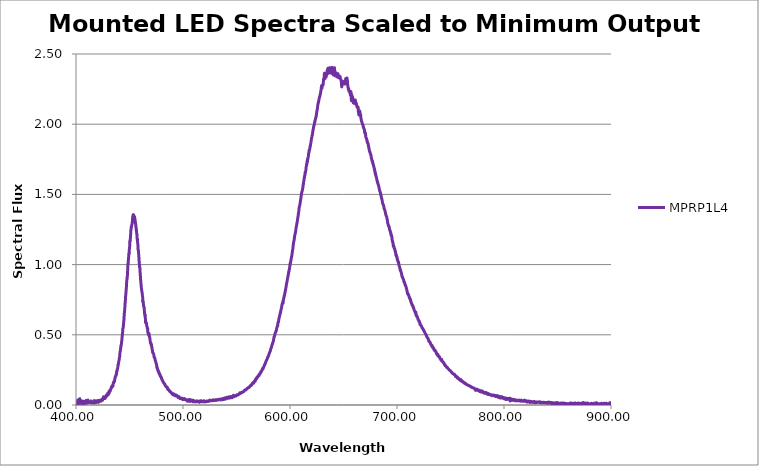
| Category | MPRP1L4 |
|---|---|
| 199.975 | 0 |
| 200.177 | 0 |
| 200.378 | 0 |
| 200.58 | 0 |
| 200.781 | 0 |
| 200.983 | 0 |
| 201.184 | 0 |
| 201.386 | 0 |
| 201.588 | 0 |
| 201.789 | 0 |
| 201.991 | 0 |
| 202.193 | 0 |
| 202.394 | 0 |
| 202.596 | 0 |
| 202.798 | 0 |
| 202.999 | 0 |
| 203.201 | 0 |
| 203.403 | 0 |
| 203.605 | 0 |
| 203.806 | 0 |
| 204.008 | 0 |
| 204.21 | 0 |
| 204.412 | 0 |
| 204.614 | 0 |
| 204.816 | 0 |
| 205.018 | 0 |
| 205.219 | 0 |
| 205.421 | 0 |
| 205.623 | 0 |
| 205.825 | 0 |
| 206.027 | 0 |
| 206.229 | 0 |
| 206.431 | 0 |
| 206.633 | 0 |
| 206.836 | 0 |
| 207.038 | 0 |
| 207.24 | 0 |
| 207.442 | 0 |
| 207.644 | 0 |
| 207.846 | 0 |
| 208.048 | 0 |
| 208.251 | 0 |
| 208.453 | 0 |
| 208.655 | 0 |
| 208.857 | 0 |
| 209.06 | 0 |
| 209.262 | 0 |
| 209.464 | 0 |
| 209.667 | 0 |
| 209.869 | 0 |
| 210.071 | 0 |
| 210.274 | 0 |
| 210.476 | 0 |
| 210.678 | 0 |
| 210.881 | 0 |
| 211.083 | 0 |
| 211.286 | 0 |
| 211.488 | 0 |
| 211.691 | 0 |
| 211.893 | 0 |
| 212.096 | 0 |
| 212.299 | 0 |
| 212.501 | 0 |
| 212.704 | 0 |
| 212.906 | 0 |
| 213.109 | 0 |
| 213.312 | 0 |
| 213.514 | 0 |
| 213.717 | 0 |
| 213.92 | 0 |
| 214.123 | 0 |
| 214.325 | 0 |
| 214.528 | 0 |
| 214.731 | 0 |
| 214.934 | 0 |
| 215.137 | 0 |
| 215.339 | 0 |
| 215.542 | 0 |
| 215.745 | 0 |
| 215.948 | 0 |
| 216.151 | 0 |
| 216.354 | 0 |
| 216.557 | 0 |
| 216.76 | 0 |
| 216.963 | 0 |
| 217.166 | 0 |
| 217.369 | 0 |
| 217.572 | 0 |
| 217.775 | 0 |
| 217.978 | 0 |
| 218.181 | 0 |
| 218.385 | 0 |
| 218.588 | 0 |
| 218.791 | 0 |
| 218.994 | 0 |
| 219.197 | 0 |
| 219.4 | 0 |
| 219.604 | 0 |
| 219.807 | 0 |
| 220.01 | 0 |
| 220.214 | 0 |
| 220.417 | 0 |
| 220.62 | 0 |
| 220.824 | 0 |
| 221.027 | 0 |
| 221.23 | 0 |
| 221.434 | 0 |
| 221.637 | 0 |
| 221.841 | 0 |
| 222.044 | 0 |
| 222.248 | 0 |
| 222.451 | 0 |
| 222.655 | 0 |
| 222.858 | 0 |
| 223.062 | 0 |
| 223.265 | 0 |
| 223.469 | 0 |
| 223.672 | 0 |
| 223.876 | 0 |
| 224.08 | 0 |
| 224.283 | 0 |
| 224.487 | 0 |
| 224.691 | 0 |
| 224.894 | 0 |
| 225.098 | 0 |
| 225.302 | 0 |
| 225.506 | 0 |
| 225.71 | 0 |
| 225.913 | 0 |
| 226.117 | 0 |
| 226.321 | 0 |
| 226.525 | 0 |
| 226.729 | 0 |
| 226.933 | 0 |
| 227.137 | 0 |
| 227.341 | 0 |
| 227.544 | 0 |
| 227.748 | 0 |
| 227.952 | 0 |
| 228.156 | 0 |
| 228.361 | 0 |
| 228.565 | 0 |
| 228.769 | 0 |
| 228.973 | 0 |
| 229.177 | 0 |
| 229.381 | 0 |
| 229.585 | 0 |
| 229.789 | 0 |
| 229.993 | 0 |
| 230.198 | 0 |
| 230.402 | 0 |
| 230.606 | 0 |
| 230.81 | 0 |
| 231.015 | 0 |
| 231.219 | 0 |
| 231.423 | 0 |
| 231.627 | 0 |
| 231.832 | 0 |
| 232.036 | 0 |
| 232.241 | 0 |
| 232.445 | 0 |
| 232.649 | 0 |
| 232.854 | 0 |
| 233.058 | 0 |
| 233.263 | 0 |
| 233.467 | 0 |
| 233.672 | 0 |
| 233.876 | 0 |
| 234.081 | 0 |
| 234.285 | 0 |
| 234.49 | 0 |
| 234.695 | 0 |
| 234.899 | 0 |
| 235.104 | 0 |
| 235.308 | 0 |
| 235.513 | 0 |
| 235.718 | 0 |
| 235.922 | 0 |
| 236.127 | 0 |
| 236.332 | 0 |
| 236.537 | 0 |
| 236.741 | 0 |
| 236.946 | 0 |
| 237.151 | 0 |
| 237.356 | 0 |
| 237.561 | 0 |
| 237.766 | 0 |
| 237.971 | 0 |
| 238.175 | 0 |
| 238.38 | 0 |
| 238.585 | 0 |
| 238.79 | 0 |
| 238.995 | 0 |
| 239.2 | 0 |
| 239.405 | 0 |
| 239.61 | 0 |
| 239.815 | 0 |
| 240.02 | 0 |
| 240.225 | 0 |
| 240.431 | 0 |
| 240.636 | 0 |
| 240.841 | 0 |
| 241.046 | 0 |
| 241.251 | 0 |
| 241.456 | 0 |
| 241.662 | 0 |
| 241.867 | 0 |
| 242.072 | 0 |
| 242.277 | 0 |
| 242.483 | 0 |
| 242.688 | 0 |
| 242.893 | 0 |
| 243.098 | 0 |
| 243.304 | 0 |
| 243.509 | 0 |
| 243.715 | 0 |
| 243.92 | 0 |
| 244.125 | 0 |
| 244.331 | 0 |
| 244.536 | 0 |
| 244.742 | 0 |
| 244.947 | 0 |
| 245.153 | 0 |
| 245.358 | 0 |
| 245.564 | 0 |
| 245.769 | 0 |
| 245.975 | 0 |
| 246.181 | 0 |
| 246.386 | 0 |
| 246.592 | 0 |
| 246.798 | 0 |
| 247.003 | 0 |
| 247.209 | 0 |
| 247.415 | 0 |
| 247.62 | 0 |
| 247.826 | 0 |
| 248.032 | 0 |
| 248.238 | 0 |
| 248.443 | 0 |
| 248.649 | 0 |
| 248.855 | 0 |
| 249.061 | 0 |
| 249.267 | 0 |
| 249.473 | 0 |
| 249.679 | 0 |
| 249.885 | 0 |
| 250.091 | 0 |
| 250.297 | 0 |
| 250.502 | 0 |
| 250.708 | 0 |
| 250.914 | 0 |
| 251.121 | 0 |
| 251.327 | 0 |
| 251.533 | 0 |
| 251.739 | 0 |
| 251.945 | 0 |
| 252.151 | 0 |
| 252.357 | 0 |
| 252.563 | 0 |
| 252.769 | 0 |
| 252.976 | 0 |
| 253.182 | 0 |
| 253.388 | 0 |
| 253.594 | 0 |
| 253.801 | 0 |
| 254.007 | 0 |
| 254.213 | 0 |
| 254.419 | 0 |
| 254.626 | 0 |
| 254.832 | 0 |
| 255.039 | 0 |
| 255.245 | 0 |
| 255.451 | 0 |
| 255.658 | 0 |
| 255.864 | 0 |
| 256.071 | 0 |
| 256.277 | 0 |
| 256.484 | 0 |
| 256.69 | 0 |
| 256.897 | 0 |
| 257.103 | 0 |
| 257.31 | 0 |
| 257.516 | 0 |
| 257.723 | 0 |
| 257.93 | 0 |
| 258.136 | 0 |
| 258.343 | 0 |
| 258.55 | 0 |
| 258.756 | 0 |
| 258.963 | 0 |
| 259.17 | 0 |
| 259.376 | 0 |
| 259.583 | 0 |
| 259.79 | 0 |
| 259.997 | 0 |
| 260.204 | 0 |
| 260.41 | 0 |
| 260.617 | 0 |
| 260.824 | 0 |
| 261.031 | 0 |
| 261.238 | 0 |
| 261.445 | 0 |
| 261.652 | 0 |
| 261.859 | 0 |
| 262.066 | 0 |
| 262.273 | 0 |
| 262.48 | 0 |
| 262.687 | 0 |
| 262.894 | 0 |
| 263.101 | 0 |
| 263.308 | 0 |
| 263.515 | 0 |
| 263.722 | 0 |
| 263.929 | 0 |
| 264.136 | 0 |
| 264.343 | 0 |
| 264.551 | 0 |
| 264.758 | 0 |
| 264.965 | 0 |
| 265.172 | 0 |
| 265.38 | 0 |
| 265.587 | 0 |
| 265.794 | 0 |
| 266.001 | 0 |
| 266.209 | 0 |
| 266.416 | 0 |
| 266.623 | 0 |
| 266.831 | 0 |
| 267.038 | 0 |
| 267.246 | 0 |
| 267.453 | 0 |
| 267.66 | 0 |
| 267.868 | 0 |
| 268.075 | 0 |
| 268.283 | 0 |
| 268.49 | 0 |
| 268.698 | 0 |
| 268.905 | 0 |
| 269.113 | 0 |
| 269.321 | 0 |
| 269.528 | 0 |
| 269.736 | 0 |
| 269.943 | 0 |
| 270.151 | 0 |
| 270.359 | 0 |
| 270.567 | 0 |
| 270.774 | 0 |
| 270.982 | 0 |
| 271.19 | 0 |
| 271.397 | 0 |
| 271.605 | 0 |
| 271.813 | 0 |
| 272.021 | 0 |
| 272.229 | 0 |
| 272.436 | 0 |
| 272.644 | 0 |
| 272.852 | 0 |
| 273.06 | 0 |
| 273.268 | 0 |
| 273.476 | 0 |
| 273.684 | 0 |
| 273.892 | 0 |
| 274.1 | 0 |
| 274.308 | 0 |
| 274.516 | 0 |
| 274.724 | 0 |
| 274.932 | 0 |
| 275.14 | 0 |
| 275.348 | 0 |
| 275.556 | 0 |
| 275.764 | 0 |
| 275.973 | 0 |
| 276.181 | 0 |
| 276.389 | 0 |
| 276.597 | 0 |
| 276.805 | 0 |
| 277.013 | 0 |
| 277.222 | 0 |
| 277.43 | 0 |
| 277.638 | 0 |
| 277.847 | 0 |
| 278.055 | 0 |
| 278.263 | 0 |
| 278.472 | 0 |
| 278.68 | 0 |
| 278.888 | 0 |
| 279.097 | 0 |
| 279.305 | 0 |
| 279.514 | 0 |
| 279.722 | 0 |
| 279.93 | 0 |
| 280.139 | 0 |
| 280.347 | 0 |
| 280.556 | 0 |
| 280.764 | 0 |
| 280.973 | 0 |
| 281.182 | 0 |
| 281.39 | 0 |
| 281.599 | 0 |
| 281.807 | 0 |
| 282.016 | 0 |
| 282.225 | 0 |
| 282.433 | 0 |
| 282.642 | 0 |
| 282.851 | 0 |
| 283.06 | 0 |
| 283.268 | 0 |
| 283.477 | 0 |
| 283.686 | 0 |
| 283.895 | 0 |
| 284.103 | 0 |
| 284.312 | 0 |
| 284.521 | 0 |
| 284.73 | 0 |
| 284.939 | 0 |
| 285.148 | 0 |
| 285.357 | 0 |
| 285.566 | 0 |
| 285.775 | 0 |
| 285.984 | 0 |
| 286.193 | 0 |
| 286.402 | 0 |
| 286.611 | 0 |
| 286.82 | 0 |
| 287.029 | 0 |
| 287.238 | 0 |
| 287.447 | 0 |
| 287.656 | 0 |
| 287.865 | 0 |
| 288.074 | 0 |
| 288.283 | 0 |
| 288.492 | 0 |
| 288.702 | 0 |
| 288.911 | 0 |
| 289.12 | 0 |
| 289.329 | 0 |
| 289.539 | 0 |
| 289.748 | 0 |
| 289.957 | 0 |
| 290.166 | 0 |
| 290.376 | 0 |
| 290.585 | 0 |
| 290.795 | 0 |
| 291.004 | 0 |
| 291.213 | 0 |
| 291.423 | 0 |
| 291.632 | 0 |
| 291.842 | 0 |
| 292.051 | 0 |
| 292.26 | 0 |
| 292.47 | 0 |
| 292.68 | 0 |
| 292.889 | 0 |
| 293.099 | 0 |
| 293.308 | 0 |
| 293.518 | 0 |
| 293.727 | 0 |
| 293.937 | 0 |
| 294.147 | 0 |
| 294.356 | 0 |
| 294.566 | 0 |
| 294.776 | 0 |
| 294.985 | 0 |
| 295.195 | 0 |
| 295.405 | 0 |
| 295.614 | 0 |
| 295.824 | 0 |
| 296.034 | 0 |
| 296.244 | 0 |
| 296.454 | 0 |
| 296.663 | 0 |
| 296.873 | 0 |
| 297.083 | 0 |
| 297.293 | 0 |
| 297.503 | 0 |
| 297.713 | 0 |
| 297.923 | 0 |
| 298.133 | 0 |
| 298.343 | 0 |
| 298.553 | 0 |
| 298.763 | 0 |
| 298.973 | 0 |
| 299.183 | 0 |
| 299.393 | 0 |
| 299.603 | 0 |
| 299.813 | 0 |
| 300.023 | 0 |
| 300.233 | 0 |
| 300.443 | 0 |
| 300.654 | 0 |
| 300.864 | 0 |
| 301.074 | 0 |
| 301.284 | 0 |
| 301.494 | 0 |
| 301.705 | 0 |
| 301.915 | 0 |
| 302.125 | 0 |
| 302.335 | 0 |
| 302.546 | 0 |
| 302.756 | 0 |
| 302.966 | 0 |
| 303.177 | 0 |
| 303.387 | 0 |
| 303.598 | 0 |
| 303.808 | 0 |
| 304.018 | 0 |
| 304.229 | 0 |
| 304.439 | 0 |
| 304.65 | 0 |
| 304.86 | 0 |
| 305.071 | 0 |
| 305.281 | 0 |
| 305.492 | 0 |
| 305.702 | 0 |
| 305.913 | 0 |
| 306.124 | 0 |
| 306.334 | 0 |
| 306.545 | 0 |
| 306.755 | 0 |
| 306.966 | 0 |
| 307.177 | 0 |
| 307.387 | 0 |
| 307.598 | 0 |
| 307.809 | 0 |
| 308.02 | 0 |
| 308.23 | 0 |
| 308.441 | 0 |
| 308.652 | 0 |
| 308.863 | 0 |
| 309.074 | 0 |
| 309.284 | 0 |
| 309.495 | 0 |
| 309.706 | 0 |
| 309.917 | 0 |
| 310.128 | 0 |
| 310.339 | 0 |
| 310.55 | 0 |
| 310.761 | 0 |
| 310.972 | 0 |
| 311.183 | 0 |
| 311.394 | 0 |
| 311.605 | 0 |
| 311.816 | 0 |
| 312.027 | 0 |
| 312.238 | 0 |
| 312.449 | 0 |
| 312.66 | 0 |
| 312.871 | 0 |
| 313.083 | 0 |
| 313.294 | 0 |
| 313.505 | 0 |
| 313.716 | 0 |
| 313.927 | 0 |
| 314.139 | 0 |
| 314.35 | 0 |
| 314.561 | 0 |
| 314.772 | 0 |
| 314.984 | 0 |
| 315.195 | 0 |
| 315.406 | 0 |
| 315.618 | 0 |
| 315.829 | 0 |
| 316.04 | 0 |
| 316.252 | 0 |
| 316.463 | 0 |
| 316.675 | 0 |
| 316.886 | 0 |
| 317.097 | 0 |
| 317.309 | 0 |
| 317.52 | 0 |
| 317.732 | 0 |
| 317.943 | 0 |
| 318.155 | 0 |
| 318.367 | 0 |
| 318.578 | 0 |
| 318.79 | 0 |
| 319.001 | 0 |
| 319.213 | 0 |
| 319.425 | 0 |
| 319.636 | 0 |
| 319.848 | 0 |
| 320.06 | 0 |
| 320.271 | 0 |
| 320.483 | 0 |
| 320.695 | 0 |
| 320.907 | 0 |
| 321.118 | 0 |
| 321.33 | 0 |
| 321.542 | 0 |
| 321.754 | 0 |
| 321.966 | 0 |
| 322.177 | 0 |
| 322.389 | 0 |
| 322.601 | 0 |
| 322.813 | 0 |
| 323.025 | 0 |
| 323.237 | 0 |
| 323.449 | 0 |
| 323.661 | 0 |
| 323.873 | 0 |
| 324.085 | 0 |
| 324.297 | 0 |
| 324.509 | 0 |
| 324.721 | 0 |
| 324.933 | 0 |
| 325.145 | 0 |
| 325.357 | 0 |
| 325.569 | 0 |
| 325.781 | 0 |
| 325.994 | 0 |
| 326.206 | 0 |
| 326.418 | 0 |
| 326.63 | 0 |
| 326.842 | 0 |
| 327.055 | 0 |
| 327.267 | 0 |
| 327.479 | 0 |
| 327.691 | 0 |
| 327.904 | 0 |
| 328.116 | 0 |
| 328.328 | 0 |
| 328.541 | 0 |
| 328.753 | 0 |
| 328.965 | 0 |
| 329.178 | 0 |
| 329.39 | 0 |
| 329.603 | 0 |
| 329.815 | 0 |
| 330.028 | 0 |
| 330.24 | 0 |
| 330.453 | 0 |
| 330.665 | 0 |
| 330.878 | 0 |
| 331.09 | 0 |
| 331.303 | 0 |
| 331.515 | 0 |
| 331.728 | 0 |
| 331.94 | 0 |
| 332.153 | 0 |
| 332.366 | 0 |
| 332.578 | 0 |
| 332.791 | 0 |
| 333.004 | 0 |
| 333.216 | 0 |
| 333.429 | 0 |
| 333.642 | 0 |
| 333.855 | 0 |
| 334.067 | 0 |
| 334.28 | 0 |
| 334.493 | 0 |
| 334.706 | 0 |
| 334.919 | 0 |
| 335.132 | 0 |
| 335.344 | 0 |
| 335.557 | 0 |
| 335.77 | 0 |
| 335.983 | 0 |
| 336.196 | 0 |
| 336.409 | 0 |
| 336.622 | 0 |
| 336.835 | 0 |
| 337.048 | 0 |
| 337.261 | 0 |
| 337.474 | 0 |
| 337.687 | 0 |
| 337.9 | 0 |
| 338.113 | 0 |
| 338.326 | 0 |
| 338.539 | 0 |
| 338.752 | 0 |
| 338.966 | 0 |
| 339.179 | 0 |
| 339.392 | 0 |
| 339.605 | 0 |
| 339.818 | 0 |
| 340.032 | 0 |
| 340.245 | 0 |
| 340.458 | 0 |
| 340.671 | 0 |
| 340.885 | 0 |
| 341.098 | 0 |
| 341.311 | 0 |
| 341.525 | 0 |
| 341.738 | 0 |
| 341.951 | 0 |
| 342.165 | 0 |
| 342.378 | 0 |
| 342.591 | 0 |
| 342.805 | 0 |
| 343.018 | 0 |
| 343.232 | 0 |
| 343.445 | 0 |
| 343.659 | 0 |
| 343.872 | 0 |
| 344.086 | 0 |
| 344.299 | 0 |
| 344.513 | 0 |
| 344.727 | 0 |
| 344.94 | 0 |
| 345.154 | 0 |
| 345.367 | 0 |
| 345.581 | 0 |
| 345.795 | 0 |
| 346.008 | 0 |
| 346.222 | 0 |
| 346.436 | 0 |
| 346.649 | 0 |
| 346.863 | 0 |
| 347.077 | 0 |
| 347.291 | 0 |
| 347.504 | 0 |
| 347.718 | 0 |
| 347.932 | 0 |
| 348.146 | 0 |
| 348.36 | 0 |
| 348.574 | 0 |
| 348.787 | 0 |
| 349.001 | 0 |
| 349.215 | 0 |
| 349.429 | 0 |
| 349.643 | 0 |
| 349.857 | 0 |
| 350.071 | 0 |
| 350.285 | 0 |
| 350.499 | 0 |
| 350.713 | 0 |
| 350.927 | 0 |
| 351.141 | 0 |
| 351.355 | 0 |
| 351.569 | 0 |
| 351.783 | 0 |
| 351.998 | 0 |
| 352.212 | 0 |
| 352.426 | 0 |
| 352.64 | 0 |
| 352.854 | 0 |
| 353.068 | 0 |
| 353.283 | 0 |
| 353.497 | 0 |
| 353.711 | 0 |
| 353.925 | 0 |
| 354.14 | 0 |
| 354.354 | 0 |
| 354.568 | 0 |
| 354.783 | 0 |
| 354.997 | 0 |
| 355.211 | 0 |
| 355.426 | 0 |
| 355.64 | 0 |
| 355.854 | 0 |
| 356.069 | 0 |
| 356.283 | 0 |
| 356.498 | 0 |
| 356.712 | 0 |
| 356.927 | 0 |
| 357.141 | 0 |
| 357.356 | 0 |
| 357.57 | 0 |
| 357.785 | 0 |
| 357.999 | 0 |
| 358.214 | 0 |
| 358.429 | 0 |
| 358.643 | 0 |
| 358.858 | 0 |
| 359.072 | 0 |
| 359.287 | 0 |
| 359.502 | 0 |
| 359.716 | 0 |
| 359.931 | 0 |
| 360.146 | 0 |
| 360.361 | 0 |
| 360.575 | 0 |
| 360.79 | 0 |
| 361.005 | 0 |
| 361.22 | 0 |
| 361.434 | 0 |
| 361.649 | 0 |
| 361.864 | 0 |
| 362.079 | 0 |
| 362.294 | 0 |
| 362.509 | 0 |
| 362.724 | 0 |
| 362.939 | 0 |
| 363.154 | 0 |
| 363.369 | 0 |
| 363.583 | 0 |
| 363.798 | 0 |
| 364.013 | 0 |
| 364.228 | 0 |
| 364.444 | 0 |
| 364.659 | 0 |
| 364.874 | 0 |
| 365.089 | 0 |
| 365.304 | 0 |
| 365.519 | 0 |
| 365.734 | 0 |
| 365.949 | 0 |
| 366.164 | 0 |
| 366.38 | 0 |
| 366.595 | 0 |
| 366.81 | 0 |
| 367.025 | 0 |
| 367.24 | 0 |
| 367.456 | 0 |
| 367.671 | 0 |
| 367.886 | 0 |
| 368.101 | 0 |
| 368.317 | 0 |
| 368.532 | 0 |
| 368.747 | 0 |
| 368.963 | 0 |
| 369.178 | 0 |
| 369.394 | 0 |
| 369.609 | 0 |
| 369.824 | 0 |
| 370.04 | 0 |
| 370.255 | 0 |
| 370.471 | 0 |
| 370.686 | 0 |
| 370.902 | 0 |
| 371.117 | 0 |
| 371.333 | 0 |
| 371.548 | 0 |
| 371.764 | 0 |
| 371.98 | 0 |
| 372.195 | 0 |
| 372.411 | 0 |
| 372.626 | 0 |
| 372.842 | 0 |
| 373.058 | 0 |
| 373.273 | 0 |
| 373.489 | 0 |
| 373.705 | 0 |
| 373.92 | 0 |
| 374.136 | 0 |
| 374.352 | 0 |
| 374.568 | 0 |
| 374.783 | 0 |
| 374.999 | 0 |
| 375.215 | 0 |
| 375.431 | 0 |
| 375.647 | 0 |
| 375.863 | 0 |
| 376.078 | 0 |
| 376.294 | 0 |
| 376.51 | 0 |
| 376.726 | 0 |
| 376.942 | 0 |
| 377.158 | 0 |
| 377.374 | 0 |
| 377.59 | 0 |
| 377.806 | 0 |
| 378.022 | 0 |
| 378.238 | 0 |
| 378.454 | 0 |
| 378.67 | 0 |
| 378.886 | 0 |
| 379.102 | 0 |
| 379.318 | 0 |
| 379.535 | 0 |
| 379.751 | 0 |
| 379.967 | 0 |
| 380.183 | 0 |
| 380.399 | 0 |
| 380.615 | 0 |
| 380.832 | 0 |
| 381.048 | 0 |
| 381.264 | 0 |
| 381.48 | 0 |
| 381.697 | 0 |
| 381.913 | 0 |
| 382.129 | 0 |
| 382.346 | 0 |
| 382.562 | 0 |
| 382.778 | 0 |
| 382.995 | 0 |
| 383.211 | 0 |
| 383.427 | 0 |
| 383.644 | 0 |
| 383.86 | 0 |
| 384.077 | 0.004 |
| 384.293 | 0.023 |
| 384.51 | 0.027 |
| 384.726 | 0.038 |
| 384.943 | 0.049 |
| 385.159 | 0.044 |
| 385.376 | 0.035 |
| 385.592 | 0.032 |
| 385.809 | 0.045 |
| 386.025 | 0.04 |
| 386.242 | 0.043 |
| 386.458 | 0.033 |
| 386.675 | 0.052 |
| 386.892 | 0.02 |
| 387.108 | 0.026 |
| 387.325 | 0.027 |
| 387.542 | 0.027 |
| 387.758 | 0.02 |
| 387.975 | 0.027 |
| 388.192 | 0.032 |
| 388.409 | 0.024 |
| 388.625 | 0.037 |
| 388.842 | 0.029 |
| 389.059 | 0.017 |
| 389.276 | 0.042 |
| 389.493 | 0.02 |
| 389.709 | 0.028 |
| 389.926 | 0.024 |
| 390.143 | 0.038 |
| 390.36 | 0.031 |
| 390.577 | 0.028 |
| 390.794 | 0.007 |
| 391.011 | 0.024 |
| 391.228 | 0.033 |
| 391.445 | 0.032 |
| 391.662 | 0.007 |
| 391.879 | 0.03 |
| 392.096 | 0.015 |
| 392.313 | 0.02 |
| 392.53 | 0.025 |
| 392.747 | 0.021 |
| 392.964 | 0.014 |
| 393.181 | 0.025 |
| 393.398 | 0.025 |
| 393.615 | 0.015 |
| 393.832 | 0.015 |
| 394.049 | 0.023 |
| 394.267 | 0.017 |
| 394.484 | 0.016 |
| 394.701 | 0.013 |
| 394.918 | 0.018 |
| 395.135 | 0.008 |
| 395.353 | 0.006 |
| 395.57 | 0.033 |
| 395.787 | 0.037 |
| 396.004 | 0.018 |
| 396.222 | 0.013 |
| 396.439 | 0.01 |
| 396.656 | 0.009 |
| 396.874 | 0.033 |
| 397.091 | 0.01 |
| 397.308 | 0.019 |
| 397.526 | 0.015 |
| 397.743 | 0.023 |
| 397.96 | 0.015 |
| 398.178 | 0.012 |
| 398.395 | 0.013 |
| 398.613 | 0.014 |
| 398.83 | 0.009 |
| 399.048 | 0.023 |
| 399.265 | 0.026 |
| 399.483 | 0.004 |
| 399.7 | 0.013 |
| 399.918 | 0.012 |
| 400.135 | 0.027 |
| 400.353 | 0.022 |
| 400.571 | 0.018 |
| 400.788 | 0.018 |
| 401.006 | 0.03 |
| 401.223 | -0.003 |
| 401.441 | 0.024 |
| 401.659 | 0.014 |
| 401.876 | 0.021 |
| 402.094 | 0.017 |
| 402.312 | 0.038 |
| 402.53 | 0.012 |
| 402.747 | 0.031 |
| 402.965 | 0.029 |
| 403.183 | 0.034 |
| 403.401 | 0.014 |
| 403.618 | 0.045 |
| 403.836 | 0.012 |
| 404.054 | 0.024 |
| 404.272 | 0.013 |
| 404.49 | 0.025 |
| 404.708 | 0.021 |
| 404.926 | 0.031 |
| 405.144 | 0.023 |
| 405.361 | 0.027 |
| 405.579 | 0.018 |
| 405.797 | 0.016 |
| 406.015 | 0.011 |
| 406.233 | 0.026 |
| 406.451 | 0.015 |
| 406.669 | 0.027 |
| 406.887 | 0.023 |
| 407.105 | 0.024 |
| 407.323 | 0.011 |
| 407.541 | 0.017 |
| 407.76 | 0.018 |
| 407.978 | 0.019 |
| 408.196 | 0.012 |
| 408.414 | 0.022 |
| 408.632 | 0.028 |
| 408.85 | 0.023 |
| 409.068 | 0.014 |
| 409.287 | 0.013 |
| 409.505 | 0.033 |
| 409.723 | 0.017 |
| 409.941 | 0.022 |
| 410.159 | 0.014 |
| 410.378 | 0.025 |
| 410.596 | 0.021 |
| 410.814 | 0.028 |
| 411.033 | 0.018 |
| 411.251 | 0.037 |
| 411.469 | 0.017 |
| 411.688 | 0.024 |
| 411.906 | 0.02 |
| 412.124 | 0.022 |
| 412.343 | 0.022 |
| 412.561 | 0.021 |
| 412.78 | 0.009 |
| 412.998 | 0.017 |
| 413.216 | 0.017 |
| 413.435 | 0.021 |
| 413.653 | 0.019 |
| 413.872 | 0.029 |
| 414.09 | 0.025 |
| 414.309 | 0.025 |
| 414.528 | 0.018 |
| 414.746 | 0.023 |
| 414.965 | 0.015 |
| 415.183 | 0.019 |
| 415.402 | 0.022 |
| 415.62 | 0.018 |
| 415.839 | 0.017 |
| 416.058 | 0.02 |
| 416.276 | 0.018 |
| 416.495 | 0.017 |
| 416.714 | 0.017 |
| 416.932 | 0.031 |
| 417.151 | 0.023 |
| 417.37 | 0.025 |
| 417.589 | 0.018 |
| 417.807 | 0.015 |
| 418.026 | 0.02 |
| 418.245 | 0.026 |
| 418.464 | 0.02 |
| 418.683 | 0.03 |
| 418.901 | 0.018 |
| 419.12 | 0.021 |
| 419.339 | 0.021 |
| 419.558 | 0.022 |
| 419.777 | 0.026 |
| 419.996 | 0.026 |
| 420.215 | 0.021 |
| 420.434 | 0.029 |
| 420.653 | 0.032 |
| 420.872 | 0.027 |
| 421.091 | 0.019 |
| 421.31 | 0.03 |
| 421.529 | 0.026 |
| 421.748 | 0.025 |
| 421.967 | 0.028 |
| 422.186 | 0.034 |
| 422.405 | 0.028 |
| 422.624 | 0.03 |
| 422.843 | 0.03 |
| 423.062 | 0.036 |
| 423.281 | 0.027 |
| 423.5 | 0.033 |
| 423.72 | 0.031 |
| 423.939 | 0.036 |
| 424.158 | 0.034 |
| 424.377 | 0.041 |
| 424.596 | 0.036 |
| 424.816 | 0.033 |
| 425.035 | 0.042 |
| 425.254 | 0.044 |
| 425.473 | 0.05 |
| 425.693 | 0.059 |
| 425.912 | 0.053 |
| 426.131 | 0.046 |
| 426.351 | 0.051 |
| 426.57 | 0.056 |
| 426.789 | 0.049 |
| 427.009 | 0.049 |
| 427.228 | 0.047 |
| 427.448 | 0.06 |
| 427.667 | 0.054 |
| 427.886 | 0.062 |
| 428.106 | 0.059 |
| 428.325 | 0.07 |
| 428.545 | 0.065 |
| 428.764 | 0.068 |
| 428.984 | 0.065 |
| 429.203 | 0.071 |
| 429.423 | 0.072 |
| 429.642 | 0.083 |
| 429.862 | 0.079 |
| 430.082 | 0.074 |
| 430.301 | 0.075 |
| 430.521 | 0.081 |
| 430.74 | 0.094 |
| 430.96 | 0.098 |
| 431.18 | 0.085 |
| 431.399 | 0.098 |
| 431.619 | 0.098 |
| 431.839 | 0.106 |
| 432.058 | 0.1 |
| 432.278 | 0.11 |
| 432.498 | 0.113 |
| 432.718 | 0.119 |
| 432.937 | 0.119 |
| 433.157 | 0.128 |
| 433.377 | 0.125 |
| 433.597 | 0.136 |
| 433.817 | 0.137 |
| 434.036 | 0.139 |
| 434.256 | 0.139 |
| 434.476 | 0.134 |
| 434.696 | 0.149 |
| 434.916 | 0.16 |
| 435.136 | 0.155 |
| 435.356 | 0.166 |
| 435.576 | 0.169 |
| 435.796 | 0.171 |
| 436.016 | 0.168 |
| 436.236 | 0.185 |
| 436.456 | 0.19 |
| 436.676 | 0.201 |
| 436.896 | 0.204 |
| 437.116 | 0.204 |
| 437.336 | 0.207 |
| 437.556 | 0.221 |
| 437.776 | 0.217 |
| 437.996 | 0.239 |
| 438.216 | 0.237 |
| 438.436 | 0.251 |
| 438.656 | 0.251 |
| 438.877 | 0.26 |
| 439.097 | 0.268 |
| 439.317 | 0.29 |
| 439.537 | 0.286 |
| 439.757 | 0.3 |
| 439.978 | 0.309 |
| 440.198 | 0.314 |
| 440.418 | 0.33 |
| 440.638 | 0.34 |
| 440.859 | 0.345 |
| 441.079 | 0.376 |
| 441.299 | 0.379 |
| 441.519 | 0.391 |
| 441.74 | 0.405 |
| 441.96 | 0.422 |
| 442.181 | 0.421 |
| 442.401 | 0.435 |
| 442.621 | 0.448 |
| 442.842 | 0.462 |
| 443.062 | 0.48 |
| 443.283 | 0.503 |
| 443.503 | 0.506 |
| 443.724 | 0.542 |
| 443.944 | 0.545 |
| 444.164 | 0.555 |
| 444.385 | 0.575 |
| 444.606 | 0.591 |
| 444.826 | 0.61 |
| 445.047 | 0.641 |
| 445.267 | 0.66 |
| 445.488 | 0.675 |
| 445.708 | 0.7 |
| 445.929 | 0.726 |
| 446.15 | 0.746 |
| 446.37 | 0.772 |
| 446.591 | 0.791 |
| 446.812 | 0.813 |
| 447.032 | 0.831 |
| 447.253 | 0.865 |
| 447.474 | 0.881 |
| 447.694 | 0.906 |
| 447.915 | 0.907 |
| 448.136 | 0.942 |
| 448.357 | 0.967 |
| 448.577 | 1.01 |
| 448.798 | 1.009 |
| 449.019 | 1.041 |
| 449.24 | 1.057 |
| 449.461 | 1.083 |
| 449.682 | 1.078 |
| 449.902 | 1.113 |
| 450.123 | 1.125 |
| 450.344 | 1.167 |
| 450.565 | 1.166 |
| 450.786 | 1.186 |
| 451.007 | 1.205 |
| 451.228 | 1.241 |
| 451.449 | 1.25 |
| 451.67 | 1.27 |
| 451.891 | 1.269 |
| 452.112 | 1.283 |
| 452.333 | 1.287 |
| 452.554 | 1.296 |
| 452.775 | 1.316 |
| 452.996 | 1.34 |
| 453.217 | 1.346 |
| 453.438 | 1.356 |
| 453.659 | 1.353 |
| 453.88 | 1.353 |
| 454.101 | 1.344 |
| 454.323 | 1.325 |
| 454.544 | 1.339 |
| 454.765 | 1.34 |
| 454.986 | 1.328 |
| 455.207 | 1.319 |
| 455.429 | 1.299 |
| 455.65 | 1.295 |
| 455.871 | 1.275 |
| 456.092 | 1.272 |
| 456.314 | 1.243 |
| 456.535 | 1.244 |
| 456.756 | 1.217 |
| 456.977 | 1.213 |
| 457.199 | 1.176 |
| 457.42 | 1.183 |
| 457.641 | 1.151 |
| 457.863 | 1.14 |
| 458.084 | 1.104 |
| 458.306 | 1.101 |
| 458.527 | 1.078 |
| 458.748 | 1.056 |
| 458.97 | 1.028 |
| 459.191 | 1.009 |
| 459.413 | 0.98 |
| 459.634 | 0.985 |
| 459.856 | 0.95 |
| 460.077 | 0.931 |
| 460.299 | 0.898 |
| 460.52 | 0.886 |
| 460.742 | 0.859 |
| 460.963 | 0.848 |
| 461.185 | 0.826 |
| 461.407 | 0.818 |
| 461.628 | 0.805 |
| 461.85 | 0.798 |
| 462.071 | 0.779 |
| 462.293 | 0.77 |
| 462.515 | 0.732 |
| 462.736 | 0.74 |
| 462.958 | 0.723 |
| 463.18 | 0.706 |
| 463.402 | 0.698 |
| 463.623 | 0.698 |
| 463.845 | 0.678 |
| 464.067 | 0.651 |
| 464.289 | 0.646 |
| 464.51 | 0.63 |
| 464.732 | 0.639 |
| 464.954 | 0.59 |
| 465.176 | 0.59 |
| 465.398 | 0.583 |
| 465.619 | 0.588 |
| 465.841 | 0.577 |
| 466.063 | 0.568 |
| 466.285 | 0.56 |
| 466.507 | 0.555 |
| 466.729 | 0.543 |
| 466.951 | 0.543 |
| 467.173 | 0.516 |
| 467.395 | 0.515 |
| 467.617 | 0.506 |
| 467.839 | 0.5 |
| 468.061 | 0.509 |
| 468.283 | 0.508 |
| 468.505 | 0.487 |
| 468.727 | 0.489 |
| 468.949 | 0.477 |
| 469.171 | 0.465 |
| 469.393 | 0.453 |
| 469.615 | 0.441 |
| 469.837 | 0.441 |
| 470.059 | 0.44 |
| 470.282 | 0.425 |
| 470.504 | 0.431 |
| 470.726 | 0.415 |
| 470.948 | 0.413 |
| 471.17 | 0.395 |
| 471.393 | 0.391 |
| 471.615 | 0.374 |
| 471.837 | 0.372 |
| 472.059 | 0.368 |
| 472.282 | 0.368 |
| 472.504 | 0.362 |
| 472.726 | 0.357 |
| 472.948 | 0.344 |
| 473.171 | 0.339 |
| 473.393 | 0.339 |
| 473.615 | 0.332 |
| 473.838 | 0.329 |
| 474.06 | 0.316 |
| 474.283 | 0.313 |
| 474.505 | 0.309 |
| 474.727 | 0.299 |
| 474.95 | 0.295 |
| 475.172 | 0.291 |
| 475.395 | 0.281 |
| 475.617 | 0.265 |
| 475.84 | 0.269 |
| 476.062 | 0.261 |
| 476.285 | 0.255 |
| 476.507 | 0.246 |
| 476.73 | 0.249 |
| 476.952 | 0.238 |
| 477.175 | 0.234 |
| 477.397 | 0.229 |
| 477.62 | 0.233 |
| 477.843 | 0.222 |
| 478.065 | 0.218 |
| 478.288 | 0.215 |
| 478.511 | 0.218 |
| 478.733 | 0.207 |
| 478.956 | 0.206 |
| 479.179 | 0.2 |
| 479.401 | 0.202 |
| 479.624 | 0.196 |
| 479.847 | 0.194 |
| 480.069 | 0.185 |
| 480.292 | 0.182 |
| 480.515 | 0.179 |
| 480.738 | 0.178 |
| 480.961 | 0.171 |
| 481.183 | 0.168 |
| 481.406 | 0.164 |
| 481.629 | 0.162 |
| 481.852 | 0.161 |
| 482.075 | 0.157 |
| 482.298 | 0.154 |
| 482.521 | 0.152 |
| 482.743 | 0.152 |
| 482.966 | 0.148 |
| 483.189 | 0.141 |
| 483.412 | 0.14 |
| 483.635 | 0.137 |
| 483.858 | 0.134 |
| 484.081 | 0.132 |
| 484.304 | 0.132 |
| 484.527 | 0.127 |
| 484.75 | 0.13 |
| 484.973 | 0.126 |
| 485.196 | 0.125 |
| 485.419 | 0.125 |
| 485.642 | 0.114 |
| 485.866 | 0.11 |
| 486.089 | 0.113 |
| 486.312 | 0.112 |
| 486.535 | 0.111 |
| 486.758 | 0.108 |
| 486.981 | 0.104 |
| 487.204 | 0.101 |
| 487.428 | 0.101 |
| 487.651 | 0.096 |
| 487.874 | 0.095 |
| 488.097 | 0.095 |
| 488.32 | 0.093 |
| 488.544 | 0.094 |
| 488.767 | 0.092 |
| 488.99 | 0.087 |
| 489.214 | 0.084 |
| 489.437 | 0.085 |
| 489.66 | 0.083 |
| 489.884 | 0.079 |
| 490.107 | 0.078 |
| 490.33 | 0.076 |
| 490.554 | 0.074 |
| 490.777 | 0.073 |
| 491.0 | 0.076 |
| 491.224 | 0.08 |
| 491.447 | 0.076 |
| 491.671 | 0.077 |
| 491.894 | 0.076 |
| 492.118 | 0.072 |
| 492.341 | 0.068 |
| 492.565 | 0.066 |
| 492.788 | 0.07 |
| 493.012 | 0.071 |
| 493.235 | 0.065 |
| 493.459 | 0.066 |
| 493.682 | 0.067 |
| 493.906 | 0.07 |
| 494.129 | 0.066 |
| 494.353 | 0.062 |
| 494.577 | 0.062 |
| 494.8 | 0.062 |
| 495.024 | 0.062 |
| 495.248 | 0.056 |
| 495.471 | 0.053 |
| 495.695 | 0.056 |
| 495.919 | 0.058 |
| 496.142 | 0.06 |
| 496.366 | 0.053 |
| 496.59 | 0.054 |
| 496.814 | 0.05 |
| 497.037 | 0.047 |
| 497.261 | 0.051 |
| 497.485 | 0.049 |
| 497.709 | 0.046 |
| 497.932 | 0.047 |
| 498.156 | 0.046 |
| 498.38 | 0.049 |
| 498.604 | 0.044 |
| 498.828 | 0.044 |
| 499.052 | 0.047 |
| 499.276 | 0.048 |
| 499.5 | 0.044 |
| 499.723 | 0.045 |
| 499.947 | 0.038 |
| 500.171 | 0.045 |
| 500.395 | 0.041 |
| 500.619 | 0.044 |
| 500.843 | 0.039 |
| 501.067 | 0.044 |
| 501.291 | 0.039 |
| 501.515 | 0.046 |
| 501.739 | 0.039 |
| 501.963 | 0.041 |
| 502.187 | 0.037 |
| 502.412 | 0.039 |
| 502.636 | 0.036 |
| 502.86 | 0.037 |
| 503.084 | 0.037 |
| 503.308 | 0.037 |
| 503.532 | 0.033 |
| 503.756 | 0.038 |
| 503.98 | 0.027 |
| 504.205 | 0.036 |
| 504.429 | 0.037 |
| 504.653 | 0.037 |
| 504.877 | 0.027 |
| 505.101 | 0.034 |
| 505.326 | 0.029 |
| 505.55 | 0.035 |
| 505.774 | 0.034 |
| 505.999 | 0.029 |
| 506.223 | 0.039 |
| 506.447 | 0.036 |
| 506.672 | 0.025 |
| 506.896 | 0.037 |
| 507.12 | 0.028 |
| 507.345 | 0.03 |
| 507.569 | 0.029 |
| 507.793 | 0.033 |
| 508.018 | 0.032 |
| 508.242 | 0.035 |
| 508.467 | 0.031 |
| 508.691 | 0.028 |
| 508.916 | 0.026 |
| 509.14 | 0.027 |
| 509.364 | 0.023 |
| 509.589 | 0.033 |
| 509.813 | 0.031 |
| 510.038 | 0.026 |
| 510.263 | 0.024 |
| 510.487 | 0.027 |
| 510.712 | 0.029 |
| 510.936 | 0.027 |
| 511.161 | 0.023 |
| 511.385 | 0.027 |
| 511.61 | 0.026 |
| 511.835 | 0.022 |
| 512.059 | 0.024 |
| 512.284 | 0.024 |
| 512.509 | 0.024 |
| 512.733 | 0.026 |
| 512.958 | 0.03 |
| 513.183 | 0.028 |
| 513.407 | 0.024 |
| 513.632 | 0.027 |
| 513.857 | 0.024 |
| 514.082 | 0.023 |
| 514.306 | 0.027 |
| 514.531 | 0.025 |
| 514.756 | 0.026 |
| 514.981 | 0.023 |
| 515.206 | 0.02 |
| 515.43 | 0.028 |
| 515.655 | 0.027 |
| 515.88 | 0.026 |
| 516.105 | 0.024 |
| 516.33 | 0.024 |
| 516.555 | 0.023 |
| 516.78 | 0.032 |
| 517.005 | 0.024 |
| 517.23 | 0.026 |
| 517.455 | 0.024 |
| 517.679 | 0.023 |
| 517.904 | 0.023 |
| 518.129 | 0.025 |
| 518.354 | 0.026 |
| 518.579 | 0.026 |
| 518.804 | 0.023 |
| 519.03 | 0.024 |
| 519.255 | 0.028 |
| 519.48 | 0.03 |
| 519.705 | 0.026 |
| 519.93 | 0.023 |
| 520.155 | 0.023 |
| 520.38 | 0.028 |
| 520.605 | 0.024 |
| 520.83 | 0.022 |
| 521.055 | 0.026 |
| 521.281 | 0.024 |
| 521.506 | 0.027 |
| 521.731 | 0.026 |
| 521.956 | 0.025 |
| 522.181 | 0.027 |
| 522.407 | 0.027 |
| 522.632 | 0.025 |
| 522.857 | 0.028 |
| 523.082 | 0.027 |
| 523.308 | 0.028 |
| 523.533 | 0.025 |
| 523.758 | 0.026 |
| 523.984 | 0.028 |
| 524.209 | 0.028 |
| 524.434 | 0.029 |
| 524.66 | 0.032 |
| 524.885 | 0.035 |
| 525.11 | 0.034 |
| 525.336 | 0.03 |
| 525.561 | 0.029 |
| 525.787 | 0.03 |
| 526.012 | 0.03 |
| 526.238 | 0.032 |
| 526.463 | 0.031 |
| 526.689 | 0.03 |
| 526.914 | 0.031 |
| 527.14 | 0.034 |
| 527.365 | 0.031 |
| 527.591 | 0.034 |
| 527.816 | 0.036 |
| 528.042 | 0.031 |
| 528.267 | 0.033 |
| 528.493 | 0.037 |
| 528.718 | 0.036 |
| 528.944 | 0.035 |
| 529.17 | 0.033 |
| 529.395 | 0.033 |
| 529.621 | 0.032 |
| 529.847 | 0.034 |
| 530.072 | 0.036 |
| 530.298 | 0.037 |
| 530.524 | 0.038 |
| 530.749 | 0.037 |
| 530.975 | 0.033 |
| 531.201 | 0.035 |
| 531.426 | 0.037 |
| 531.652 | 0.037 |
| 531.878 | 0.039 |
| 532.104 | 0.036 |
| 532.33 | 0.036 |
| 532.555 | 0.035 |
| 532.781 | 0.035 |
| 533.007 | 0.039 |
| 533.233 | 0.038 |
| 533.459 | 0.039 |
| 533.685 | 0.04 |
| 533.91 | 0.041 |
| 534.136 | 0.038 |
| 534.362 | 0.04 |
| 534.588 | 0.039 |
| 534.814 | 0.041 |
| 535.04 | 0.036 |
| 535.266 | 0.037 |
| 535.492 | 0.037 |
| 535.718 | 0.043 |
| 535.944 | 0.037 |
| 536.17 | 0.044 |
| 536.396 | 0.039 |
| 536.622 | 0.039 |
| 536.848 | 0.043 |
| 537.074 | 0.038 |
| 537.3 | 0.045 |
| 537.526 | 0.041 |
| 537.752 | 0.04 |
| 537.978 | 0.04 |
| 538.205 | 0.047 |
| 538.431 | 0.048 |
| 538.657 | 0.047 |
| 538.883 | 0.05 |
| 539.109 | 0.042 |
| 539.335 | 0.045 |
| 539.562 | 0.041 |
| 539.788 | 0.047 |
| 540.014 | 0.047 |
| 540.24 | 0.049 |
| 540.466 | 0.049 |
| 540.693 | 0.054 |
| 540.919 | 0.053 |
| 541.145 | 0.053 |
| 541.372 | 0.05 |
| 541.598 | 0.049 |
| 541.824 | 0.047 |
| 542.05 | 0.048 |
| 542.277 | 0.054 |
| 542.503 | 0.057 |
| 542.73 | 0.05 |
| 542.956 | 0.055 |
| 543.182 | 0.054 |
| 543.409 | 0.05 |
| 543.635 | 0.053 |
| 543.862 | 0.054 |
| 544.088 | 0.05 |
| 544.314 | 0.061 |
| 544.541 | 0.051 |
| 544.767 | 0.058 |
| 544.994 | 0.057 |
| 545.22 | 0.058 |
| 545.447 | 0.057 |
| 545.673 | 0.059 |
| 545.9 | 0.052 |
| 546.127 | 0.057 |
| 546.353 | 0.058 |
| 546.58 | 0.063 |
| 546.806 | 0.063 |
| 547.033 | 0.069 |
| 547.26 | 0.066 |
| 547.486 | 0.064 |
| 547.713 | 0.058 |
| 547.939 | 0.064 |
| 548.166 | 0.065 |
| 548.393 | 0.065 |
| 548.619 | 0.064 |
| 548.846 | 0.066 |
| 549.073 | 0.067 |
| 549.3 | 0.065 |
| 549.526 | 0.064 |
| 549.753 | 0.066 |
| 549.98 | 0.067 |
| 550.207 | 0.072 |
| 550.433 | 0.072 |
| 550.66 | 0.073 |
| 550.887 | 0.072 |
| 551.114 | 0.073 |
| 551.341 | 0.071 |
| 551.568 | 0.073 |
| 551.794 | 0.075 |
| 552.021 | 0.076 |
| 552.248 | 0.076 |
| 552.475 | 0.079 |
| 552.702 | 0.078 |
| 552.929 | 0.083 |
| 553.156 | 0.087 |
| 553.383 | 0.082 |
| 553.61 | 0.083 |
| 553.837 | 0.084 |
| 554.064 | 0.085 |
| 554.291 | 0.085 |
| 554.518 | 0.086 |
| 554.745 | 0.09 |
| 554.972 | 0.091 |
| 555.199 | 0.091 |
| 555.426 | 0.093 |
| 555.653 | 0.093 |
| 555.88 | 0.092 |
| 556.107 | 0.092 |
| 556.334 | 0.093 |
| 556.561 | 0.095 |
| 556.788 | 0.097 |
| 557.016 | 0.098 |
| 557.243 | 0.103 |
| 557.47 | 0.104 |
| 557.697 | 0.106 |
| 557.924 | 0.105 |
| 558.152 | 0.105 |
| 558.379 | 0.106 |
| 558.606 | 0.109 |
| 558.833 | 0.108 |
| 559.06 | 0.11 |
| 559.288 | 0.111 |
| 559.515 | 0.112 |
| 559.742 | 0.116 |
| 559.97 | 0.119 |
| 560.197 | 0.119 |
| 560.424 | 0.119 |
| 560.652 | 0.122 |
| 560.879 | 0.121 |
| 561.106 | 0.122 |
| 561.334 | 0.126 |
| 561.561 | 0.127 |
| 561.788 | 0.127 |
| 562.016 | 0.127 |
| 562.243 | 0.131 |
| 562.471 | 0.132 |
| 562.698 | 0.133 |
| 562.926 | 0.138 |
| 563.153 | 0.137 |
| 563.381 | 0.14 |
| 563.608 | 0.141 |
| 563.836 | 0.139 |
| 564.063 | 0.144 |
| 564.291 | 0.145 |
| 564.518 | 0.151 |
| 564.746 | 0.149 |
| 564.973 | 0.156 |
| 565.201 | 0.154 |
| 565.428 | 0.155 |
| 565.656 | 0.158 |
| 565.884 | 0.163 |
| 566.111 | 0.156 |
| 566.339 | 0.166 |
| 566.567 | 0.164 |
| 566.794 | 0.17 |
| 567.022 | 0.169 |
| 567.25 | 0.174 |
| 567.477 | 0.168 |
| 567.705 | 0.177 |
| 567.933 | 0.185 |
| 568.16 | 0.186 |
| 568.388 | 0.19 |
| 568.616 | 0.19 |
| 568.844 | 0.187 |
| 569.072 | 0.196 |
| 569.299 | 0.196 |
| 569.527 | 0.201 |
| 569.755 | 0.198 |
| 569.983 | 0.204 |
| 570.211 | 0.208 |
| 570.438 | 0.208 |
| 570.666 | 0.209 |
| 570.894 | 0.212 |
| 571.122 | 0.21 |
| 571.35 | 0.221 |
| 571.578 | 0.22 |
| 571.806 | 0.223 |
| 572.034 | 0.223 |
| 572.262 | 0.226 |
| 572.49 | 0.23 |
| 572.718 | 0.238 |
| 572.946 | 0.233 |
| 573.174 | 0.237 |
| 573.402 | 0.241 |
| 573.63 | 0.246 |
| 573.858 | 0.247 |
| 574.086 | 0.253 |
| 574.314 | 0.26 |
| 574.542 | 0.26 |
| 574.77 | 0.257 |
| 574.998 | 0.263 |
| 575.226 | 0.265 |
| 575.454 | 0.273 |
| 575.682 | 0.274 |
| 575.911 | 0.281 |
| 576.139 | 0.284 |
| 576.367 | 0.29 |
| 576.595 | 0.29 |
| 576.823 | 0.296 |
| 577.051 | 0.298 |
| 577.28 | 0.306 |
| 577.508 | 0.31 |
| 577.736 | 0.312 |
| 577.964 | 0.316 |
| 578.193 | 0.322 |
| 578.421 | 0.326 |
| 578.649 | 0.327 |
| 578.878 | 0.333 |
| 579.106 | 0.338 |
| 579.334 | 0.343 |
| 579.562 | 0.344 |
| 579.791 | 0.347 |
| 580.019 | 0.352 |
| 580.248 | 0.36 |
| 580.476 | 0.366 |
| 580.704 | 0.369 |
| 580.933 | 0.373 |
| 581.161 | 0.379 |
| 581.39 | 0.381 |
| 581.618 | 0.386 |
| 581.846 | 0.395 |
| 582.075 | 0.401 |
| 582.303 | 0.404 |
| 582.532 | 0.408 |
| 582.76 | 0.414 |
| 582.989 | 0.422 |
| 583.217 | 0.426 |
| 583.446 | 0.431 |
| 583.674 | 0.439 |
| 583.903 | 0.444 |
| 584.132 | 0.449 |
| 584.36 | 0.452 |
| 584.589 | 0.46 |
| 584.817 | 0.472 |
| 585.046 | 0.484 |
| 585.275 | 0.485 |
| 585.503 | 0.49 |
| 585.732 | 0.498 |
| 585.96 | 0.507 |
| 586.189 | 0.51 |
| 586.418 | 0.517 |
| 586.647 | 0.518 |
| 586.875 | 0.526 |
| 587.104 | 0.526 |
| 587.333 | 0.537 |
| 587.561 | 0.545 |
| 587.79 | 0.553 |
| 588.019 | 0.557 |
| 588.248 | 0.565 |
| 588.476 | 0.564 |
| 588.705 | 0.584 |
| 588.934 | 0.589 |
| 589.163 | 0.59 |
| 589.392 | 0.602 |
| 589.621 | 0.613 |
| 589.849 | 0.622 |
| 590.078 | 0.627 |
| 590.307 | 0.636 |
| 590.536 | 0.643 |
| 590.765 | 0.647 |
| 590.994 | 0.662 |
| 591.223 | 0.661 |
| 591.452 | 0.674 |
| 591.681 | 0.68 |
| 591.91 | 0.69 |
| 592.139 | 0.693 |
| 592.368 | 0.708 |
| 592.597 | 0.716 |
| 592.826 | 0.724 |
| 593.055 | 0.724 |
| 593.284 | 0.74 |
| 593.513 | 0.724 |
| 593.742 | 0.747 |
| 593.971 | 0.753 |
| 594.2 | 0.764 |
| 594.429 | 0.768 |
| 594.658 | 0.779 |
| 594.887 | 0.781 |
| 595.116 | 0.796 |
| 595.345 | 0.797 |
| 595.575 | 0.813 |
| 595.804 | 0.818 |
| 596.033 | 0.83 |
| 596.262 | 0.839 |
| 596.491 | 0.849 |
| 596.721 | 0.864 |
| 596.95 | 0.869 |
| 597.179 | 0.877 |
| 597.408 | 0.888 |
| 597.637 | 0.898 |
| 597.867 | 0.907 |
| 598.096 | 0.916 |
| 598.325 | 0.927 |
| 598.555 | 0.934 |
| 598.784 | 0.949 |
| 599.013 | 0.949 |
| 599.242 | 0.963 |
| 599.472 | 0.968 |
| 599.701 | 0.982 |
| 599.931 | 0.993 |
| 600.16 | 1.009 |
| 600.389 | 1.009 |
| 600.619 | 1.021 |
| 600.848 | 1.03 |
| 601.078 | 1.04 |
| 601.307 | 1.048 |
| 601.536 | 1.058 |
| 601.766 | 1.067 |
| 601.995 | 1.08 |
| 602.225 | 1.093 |
| 602.454 | 1.105 |
| 602.684 | 1.113 |
| 602.913 | 1.131 |
| 603.143 | 1.147 |
| 603.372 | 1.159 |
| 603.602 | 1.166 |
| 603.831 | 1.173 |
| 604.061 | 1.186 |
| 604.291 | 1.201 |
| 604.52 | 1.209 |
| 604.75 | 1.217 |
| 604.979 | 1.226 |
| 605.209 | 1.233 |
| 605.439 | 1.246 |
| 605.668 | 1.26 |
| 605.898 | 1.271 |
| 606.128 | 1.277 |
| 606.357 | 1.291 |
| 606.587 | 1.297 |
| 606.817 | 1.308 |
| 607.046 | 1.322 |
| 607.276 | 1.333 |
| 607.506 | 1.339 |
| 607.736 | 1.358 |
| 607.965 | 1.369 |
| 608.195 | 1.377 |
| 608.425 | 1.395 |
| 608.655 | 1.411 |
| 608.885 | 1.415 |
| 609.114 | 1.422 |
| 609.344 | 1.431 |
| 609.574 | 1.443 |
| 609.804 | 1.456 |
| 610.034 | 1.468 |
| 610.264 | 1.476 |
| 610.494 | 1.496 |
| 610.723 | 1.502 |
| 610.953 | 1.517 |
| 611.183 | 1.519 |
| 611.413 | 1.525 |
| 611.643 | 1.534 |
| 611.873 | 1.544 |
| 612.103 | 1.551 |
| 612.333 | 1.572 |
| 612.563 | 1.571 |
| 612.793 | 1.594 |
| 613.023 | 1.599 |
| 613.253 | 1.617 |
| 613.483 | 1.619 |
| 613.713 | 1.636 |
| 613.943 | 1.637 |
| 614.173 | 1.657 |
| 614.403 | 1.654 |
| 614.633 | 1.667 |
| 614.864 | 1.673 |
| 615.094 | 1.695 |
| 615.324 | 1.702 |
| 615.554 | 1.719 |
| 615.784 | 1.716 |
| 616.014 | 1.736 |
| 616.244 | 1.731 |
| 616.475 | 1.753 |
| 616.705 | 1.752 |
| 616.935 | 1.765 |
| 617.165 | 1.771 |
| 617.395 | 1.792 |
| 617.626 | 1.793 |
| 617.856 | 1.813 |
| 618.086 | 1.81 |
| 618.316 | 1.822 |
| 618.547 | 1.826 |
| 618.777 | 1.843 |
| 619.007 | 1.843 |
| 619.237 | 1.858 |
| 619.468 | 1.864 |
| 619.698 | 1.879 |
| 619.928 | 1.89 |
| 620.159 | 1.902 |
| 620.389 | 1.905 |
| 620.62 | 1.92 |
| 620.85 | 1.921 |
| 621.08 | 1.938 |
| 621.311 | 1.945 |
| 621.541 | 1.961 |
| 621.772 | 1.965 |
| 622.002 | 1.979 |
| 622.233 | 1.985 |
| 622.463 | 1.994 |
| 622.693 | 1.995 |
| 622.924 | 2.012 |
| 623.154 | 2.015 |
| 623.385 | 2.025 |
| 623.615 | 2.031 |
| 623.846 | 2.041 |
| 624.077 | 2.046 |
| 624.307 | 2.051 |
| 624.538 | 2.057 |
| 624.768 | 2.076 |
| 624.999 | 2.085 |
| 625.229 | 2.098 |
| 625.46 | 2.105 |
| 625.691 | 2.115 |
| 625.921 | 2.133 |
| 626.152 | 2.144 |
| 626.383 | 2.15 |
| 626.613 | 2.157 |
| 626.844 | 2.167 |
| 627.075 | 2.173 |
| 627.305 | 2.184 |
| 627.536 | 2.192 |
| 627.767 | 2.198 |
| 627.997 | 2.201 |
| 628.228 | 2.211 |
| 628.459 | 2.219 |
| 628.69 | 2.228 |
| 628.92 | 2.24 |
| 629.151 | 2.252 |
| 629.382 | 2.267 |
| 629.613 | 2.275 |
| 629.844 | 2.257 |
| 630.074 | 2.267 |
| 630.305 | 2.279 |
| 630.536 | 2.276 |
| 630.767 | 2.278 |
| 630.998 | 2.285 |
| 631.229 | 2.305 |
| 631.46 | 2.324 |
| 631.691 | 2.323 |
| 631.921 | 2.331 |
| 632.152 | 2.363 |
| 632.383 | 2.337 |
| 632.614 | 2.324 |
| 632.845 | 2.344 |
| 633.076 | 2.349 |
| 633.307 | 2.345 |
| 633.538 | 2.346 |
| 633.769 | 2.335 |
| 634.0 | 2.349 |
| 634.231 | 2.352 |
| 634.462 | 2.368 |
| 634.693 | 2.383 |
| 634.924 | 2.373 |
| 635.155 | 2.368 |
| 635.386 | 2.398 |
| 635.618 | 2.381 |
| 635.849 | 2.362 |
| 636.08 | 2.386 |
| 636.311 | 2.387 |
| 636.542 | 2.375 |
| 636.773 | 2.401 |
| 637.004 | 2.384 |
| 637.235 | 2.388 |
| 637.467 | 2.402 |
| 637.698 | 2.4 |
| 637.929 | 2.385 |
| 638.16 | 2.386 |
| 638.391 | 2.363 |
| 638.623 | 2.386 |
| 638.854 | 2.402 |
| 639.085 | 2.369 |
| 639.316 | 2.404 |
| 639.548 | 2.391 |
| 639.779 | 2.378 |
| 640.01 | 2.372 |
| 640.242 | 2.363 |
| 640.473 | 2.35 |
| 640.704 | 2.37 |
| 640.936 | 2.379 |
| 641.167 | 2.392 |
| 641.398 | 2.374 |
| 641.63 | 2.402 |
| 641.861 | 2.37 |
| 642.092 | 2.354 |
| 642.324 | 2.343 |
| 642.555 | 2.347 |
| 642.787 | 2.358 |
| 643.018 | 2.366 |
| 643.25 | 2.362 |
| 643.481 | 2.342 |
| 643.712 | 2.357 |
| 643.944 | 2.349 |
| 644.175 | 2.356 |
| 644.407 | 2.338 |
| 644.638 | 2.335 |
| 644.87 | 2.359 |
| 645.101 | 2.345 |
| 645.333 | 2.338 |
| 645.564 | 2.337 |
| 645.796 | 2.334 |
| 646.028 | 2.33 |
| 646.259 | 2.33 |
| 646.491 | 2.339 |
| 646.722 | 2.341 |
| 646.954 | 2.335 |
| 647.186 | 2.322 |
| 647.417 | 2.321 |
| 647.649 | 2.317 |
| 647.881 | 2.305 |
| 648.112 | 2.29 |
| 648.344 | 2.266 |
| 648.576 | 2.278 |
| 648.807 | 2.295 |
| 649.039 | 2.305 |
| 649.271 | 2.299 |
| 649.502 | 2.302 |
| 649.734 | 2.302 |
| 649.966 | 2.304 |
| 650.198 | 2.302 |
| 650.429 | 2.297 |
| 650.661 | 2.298 |
| 650.893 | 2.286 |
| 651.125 | 2.293 |
| 651.357 | 2.294 |
| 651.588 | 2.287 |
| 651.82 | 2.307 |
| 652.052 | 2.325 |
| 652.284 | 2.312 |
| 652.516 | 2.315 |
| 652.748 | 2.3 |
| 652.98 | 2.309 |
| 653.212 | 2.329 |
| 653.443 | 2.317 |
| 653.675 | 2.307 |
| 653.907 | 2.279 |
| 654.139 | 2.269 |
| 654.371 | 2.258 |
| 654.603 | 2.246 |
| 654.835 | 2.254 |
| 655.067 | 2.236 |
| 655.299 | 2.237 |
| 655.531 | 2.237 |
| 655.763 | 2.226 |
| 655.995 | 2.23 |
| 656.227 | 2.231 |
| 656.459 | 2.207 |
| 656.691 | 2.223 |
| 656.923 | 2.232 |
| 657.155 | 2.221 |
| 657.388 | 2.168 |
| 657.62 | 2.207 |
| 657.852 | 2.2 |
| 658.084 | 2.18 |
| 658.316 | 2.193 |
| 658.548 | 2.193 |
| 658.78 | 2.173 |
| 659.012 | 2.177 |
| 659.245 | 2.151 |
| 659.477 | 2.164 |
| 659.709 | 2.15 |
| 659.941 | 2.153 |
| 660.173 | 2.166 |
| 660.406 | 2.161 |
| 660.638 | 2.158 |
| 660.87 | 2.156 |
| 661.102 | 2.172 |
| 661.335 | 2.153 |
| 661.567 | 2.14 |
| 661.799 | 2.15 |
| 662.031 | 2.146 |
| 662.264 | 2.137 |
| 662.496 | 2.13 |
| 662.728 | 2.121 |
| 662.961 | 2.122 |
| 663.193 | 2.124 |
| 663.425 | 2.116 |
| 663.658 | 2.12 |
| 663.89 | 2.088 |
| 664.123 | 2.079 |
| 664.355 | 2.067 |
| 664.587 | 2.069 |
| 664.82 | 2.074 |
| 665.052 | 2.073 |
| 665.285 | 2.095 |
| 665.517 | 2.071 |
| 665.75 | 2.07 |
| 665.982 | 2.068 |
| 666.214 | 2.049 |
| 666.447 | 2.037 |
| 666.679 | 2.026 |
| 666.912 | 2.02 |
| 667.144 | 2.017 |
| 667.377 | 2.009 |
| 667.61 | 2.005 |
| 667.842 | 1.998 |
| 668.075 | 1.996 |
| 668.307 | 1.992 |
| 668.54 | 1.977 |
| 668.772 | 1.977 |
| 669.005 | 1.97 |
| 669.238 | 1.967 |
| 669.47 | 1.961 |
| 669.703 | 1.948 |
| 669.936 | 1.937 |
| 670.168 | 1.941 |
| 670.401 | 1.938 |
| 670.634 | 1.926 |
| 670.866 | 1.907 |
| 671.099 | 1.904 |
| 671.332 | 1.899 |
| 671.564 | 1.896 |
| 671.797 | 1.885 |
| 672.03 | 1.885 |
| 672.263 | 1.869 |
| 672.495 | 1.869 |
| 672.728 | 1.865 |
| 672.961 | 1.863 |
| 673.194 | 1.846 |
| 673.426 | 1.847 |
| 673.659 | 1.829 |
| 673.892 | 1.827 |
| 674.125 | 1.813 |
| 674.358 | 1.807 |
| 674.591 | 1.801 |
| 674.823 | 1.801 |
| 675.056 | 1.79 |
| 675.289 | 1.789 |
| 675.522 | 1.779 |
| 675.755 | 1.778 |
| 675.988 | 1.759 |
| 676.221 | 1.757 |
| 676.454 | 1.747 |
| 676.687 | 1.742 |
| 676.92 | 1.731 |
| 677.153 | 1.737 |
| 677.386 | 1.722 |
| 677.619 | 1.72 |
| 677.851 | 1.709 |
| 678.084 | 1.708 |
| 678.317 | 1.696 |
| 678.551 | 1.693 |
| 678.784 | 1.679 |
| 679.017 | 1.68 |
| 679.25 | 1.662 |
| 679.483 | 1.663 |
| 679.716 | 1.645 |
| 679.949 | 1.651 |
| 680.182 | 1.633 |
| 680.415 | 1.632 |
| 680.648 | 1.622 |
| 680.881 | 1.618 |
| 681.114 | 1.604 |
| 681.348 | 1.602 |
| 681.581 | 1.589 |
| 681.814 | 1.592 |
| 682.047 | 1.578 |
| 682.28 | 1.576 |
| 682.513 | 1.568 |
| 682.747 | 1.565 |
| 682.98 | 1.553 |
| 683.213 | 1.551 |
| 683.446 | 1.536 |
| 683.679 | 1.531 |
| 683.913 | 1.525 |
| 684.146 | 1.521 |
| 684.379 | 1.514 |
| 684.613 | 1.51 |
| 684.846 | 1.495 |
| 685.079 | 1.492 |
| 685.312 | 1.482 |
| 685.546 | 1.475 |
| 685.779 | 1.468 |
| 686.012 | 1.462 |
| 686.246 | 1.451 |
| 686.479 | 1.441 |
| 686.713 | 1.434 |
| 686.946 | 1.429 |
| 687.179 | 1.427 |
| 687.413 | 1.421 |
| 687.646 | 1.415 |
| 687.88 | 1.403 |
| 688.113 | 1.395 |
| 688.346 | 1.394 |
| 688.58 | 1.389 |
| 688.813 | 1.381 |
| 689.047 | 1.375 |
| 689.28 | 1.366 |
| 689.514 | 1.357 |
| 689.747 | 1.35 |
| 689.981 | 1.346 |
| 690.214 | 1.34 |
| 690.448 | 1.339 |
| 690.681 | 1.325 |
| 690.915 | 1.32 |
| 691.148 | 1.305 |
| 691.382 | 1.295 |
| 691.616 | 1.287 |
| 691.849 | 1.284 |
| 692.083 | 1.275 |
| 692.316 | 1.275 |
| 692.55 | 1.271 |
| 692.784 | 1.266 |
| 693.017 | 1.25 |
| 693.251 | 1.249 |
| 693.485 | 1.239 |
| 693.718 | 1.238 |
| 693.952 | 1.226 |
| 694.186 | 1.228 |
| 694.419 | 1.209 |
| 694.653 | 1.214 |
| 694.887 | 1.204 |
| 695.12 | 1.203 |
| 695.354 | 1.182 |
| 695.588 | 1.167 |
| 695.822 | 1.169 |
| 696.055 | 1.155 |
| 696.289 | 1.156 |
| 696.523 | 1.131 |
| 696.757 | 1.14 |
| 696.991 | 1.126 |
| 697.224 | 1.128 |
| 697.458 | 1.114 |
| 697.692 | 1.112 |
| 697.926 | 1.11 |
| 698.16 | 1.1 |
| 698.394 | 1.091 |
| 698.627 | 1.092 |
| 698.861 | 1.07 |
| 699.095 | 1.075 |
| 699.329 | 1.061 |
| 699.563 | 1.065 |
| 699.797 | 1.051 |
| 700.031 | 1.053 |
| 700.265 | 1.034 |
| 700.499 | 1.037 |
| 700.733 | 1.028 |
| 700.967 | 1.022 |
| 701.201 | 1.014 |
| 701.435 | 1.018 |
| 701.669 | 1.004 |
| 701.903 | 0.997 |
| 702.137 | 0.987 |
| 702.371 | 0.986 |
| 702.605 | 0.976 |
| 702.839 | 0.971 |
| 703.073 | 0.96 |
| 703.307 | 0.962 |
| 703.541 | 0.951 |
| 703.775 | 0.949 |
| 704.009 | 0.94 |
| 704.243 | 0.937 |
| 704.477 | 0.922 |
| 704.711 | 0.918 |
| 704.946 | 0.91 |
| 705.18 | 0.912 |
| 705.414 | 0.904 |
| 705.648 | 0.9 |
| 705.882 | 0.896 |
| 706.116 | 0.893 |
| 706.351 | 0.884 |
| 706.585 | 0.875 |
| 706.819 | 0.874 |
| 707.053 | 0.873 |
| 707.287 | 0.862 |
| 707.522 | 0.858 |
| 707.756 | 0.856 |
| 707.99 | 0.85 |
| 708.224 | 0.847 |
| 708.459 | 0.842 |
| 708.693 | 0.832 |
| 708.927 | 0.827 |
| 709.162 | 0.82 |
| 709.396 | 0.81 |
| 709.63 | 0.804 |
| 709.865 | 0.794 |
| 710.099 | 0.789 |
| 710.333 | 0.787 |
| 710.568 | 0.79 |
| 710.802 | 0.783 |
| 711.036 | 0.78 |
| 711.271 | 0.771 |
| 711.505 | 0.769 |
| 711.74 | 0.761 |
| 711.974 | 0.759 |
| 712.208 | 0.753 |
| 712.443 | 0.755 |
| 712.677 | 0.742 |
| 712.912 | 0.743 |
| 713.146 | 0.732 |
| 713.381 | 0.728 |
| 713.615 | 0.723 |
| 713.85 | 0.722 |
| 714.084 | 0.712 |
| 714.319 | 0.713 |
| 714.553 | 0.707 |
| 714.788 | 0.708 |
| 715.022 | 0.696 |
| 715.257 | 0.699 |
| 715.491 | 0.692 |
| 715.726 | 0.686 |
| 715.961 | 0.678 |
| 716.195 | 0.674 |
| 716.43 | 0.671 |
| 716.664 | 0.666 |
| 716.899 | 0.66 |
| 717.134 | 0.664 |
| 717.368 | 0.651 |
| 717.603 | 0.661 |
| 717.838 | 0.639 |
| 718.072 | 0.641 |
| 718.307 | 0.635 |
| 718.542 | 0.636 |
| 718.776 | 0.626 |
| 719.011 | 0.626 |
| 719.246 | 0.623 |
| 719.48 | 0.618 |
| 719.715 | 0.608 |
| 719.95 | 0.607 |
| 720.185 | 0.604 |
| 720.419 | 0.601 |
| 720.654 | 0.591 |
| 720.889 | 0.597 |
| 721.124 | 0.589 |
| 721.359 | 0.586 |
| 721.593 | 0.572 |
| 721.828 | 0.575 |
| 722.063 | 0.571 |
| 722.298 | 0.57 |
| 722.533 | 0.564 |
| 722.768 | 0.562 |
| 723.002 | 0.56 |
| 723.237 | 0.555 |
| 723.472 | 0.549 |
| 723.707 | 0.548 |
| 723.942 | 0.543 |
| 724.177 | 0.545 |
| 724.412 | 0.539 |
| 724.647 | 0.534 |
| 724.882 | 0.534 |
| 725.117 | 0.531 |
| 725.352 | 0.523 |
| 725.586 | 0.523 |
| 725.821 | 0.52 |
| 726.056 | 0.516 |
| 726.291 | 0.511 |
| 726.526 | 0.507 |
| 726.761 | 0.505 |
| 726.996 | 0.503 |
| 727.231 | 0.499 |
| 727.467 | 0.498 |
| 727.702 | 0.49 |
| 727.937 | 0.485 |
| 728.172 | 0.483 |
| 728.407 | 0.479 |
| 728.642 | 0.478 |
| 728.877 | 0.477 |
| 729.112 | 0.471 |
| 729.347 | 0.465 |
| 729.582 | 0.463 |
| 729.817 | 0.453 |
| 730.053 | 0.451 |
| 730.288 | 0.453 |
| 730.523 | 0.449 |
| 730.758 | 0.446 |
| 730.993 | 0.447 |
| 731.228 | 0.439 |
| 731.464 | 0.436 |
| 731.699 | 0.43 |
| 731.934 | 0.429 |
| 732.169 | 0.427 |
| 732.404 | 0.422 |
| 732.64 | 0.417 |
| 732.875 | 0.424 |
| 733.11 | 0.415 |
| 733.345 | 0.415 |
| 733.581 | 0.406 |
| 733.816 | 0.407 |
| 734.051 | 0.402 |
| 734.287 | 0.405 |
| 734.522 | 0.397 |
| 734.757 | 0.391 |
| 734.993 | 0.39 |
| 735.228 | 0.388 |
| 735.463 | 0.39 |
| 735.699 | 0.389 |
| 735.934 | 0.383 |
| 736.169 | 0.38 |
| 736.405 | 0.38 |
| 736.64 | 0.373 |
| 736.876 | 0.365 |
| 737.111 | 0.369 |
| 737.346 | 0.365 |
| 737.582 | 0.362 |
| 737.817 | 0.353 |
| 738.053 | 0.362 |
| 738.288 | 0.356 |
| 738.524 | 0.351 |
| 738.759 | 0.347 |
| 738.995 | 0.35 |
| 739.23 | 0.347 |
| 739.466 | 0.343 |
| 739.701 | 0.338 |
| 739.937 | 0.341 |
| 740.172 | 0.335 |
| 740.408 | 0.329 |
| 740.643 | 0.327 |
| 740.879 | 0.323 |
| 741.114 | 0.319 |
| 741.35 | 0.322 |
| 741.586 | 0.32 |
| 741.821 | 0.324 |
| 742.057 | 0.313 |
| 742.292 | 0.311 |
| 742.528 | 0.309 |
| 742.764 | 0.309 |
| 742.999 | 0.303 |
| 743.235 | 0.304 |
| 743.471 | 0.301 |
| 743.706 | 0.3 |
| 743.942 | 0.296 |
| 744.178 | 0.292 |
| 744.413 | 0.287 |
| 744.649 | 0.289 |
| 744.885 | 0.284 |
| 745.12 | 0.28 |
| 745.356 | 0.28 |
| 745.592 | 0.279 |
| 745.828 | 0.275 |
| 746.063 | 0.271 |
| 746.299 | 0.269 |
| 746.535 | 0.27 |
| 746.771 | 0.269 |
| 747.006 | 0.268 |
| 747.242 | 0.263 |
| 747.478 | 0.261 |
| 747.714 | 0.259 |
| 747.95 | 0.258 |
| 748.186 | 0.257 |
| 748.421 | 0.254 |
| 748.657 | 0.251 |
| 748.893 | 0.249 |
| 749.129 | 0.248 |
| 749.365 | 0.246 |
| 749.601 | 0.246 |
| 749.837 | 0.243 |
| 750.073 | 0.242 |
| 750.309 | 0.24 |
| 750.544 | 0.239 |
| 750.78 | 0.235 |
| 751.016 | 0.233 |
| 751.252 | 0.231 |
| 751.488 | 0.231 |
| 751.724 | 0.228 |
| 751.96 | 0.226 |
| 752.196 | 0.223 |
| 752.432 | 0.222 |
| 752.668 | 0.222 |
| 752.904 | 0.222 |
| 753.14 | 0.218 |
| 753.376 | 0.219 |
| 753.612 | 0.216 |
| 753.848 | 0.218 |
| 754.084 | 0.215 |
| 754.32 | 0.212 |
| 754.556 | 0.21 |
| 754.793 | 0.203 |
| 755.029 | 0.203 |
| 755.265 | 0.201 |
| 755.501 | 0.203 |
| 755.737 | 0.199 |
| 755.973 | 0.197 |
| 756.209 | 0.195 |
| 756.445 | 0.199 |
| 756.682 | 0.19 |
| 756.918 | 0.194 |
| 757.154 | 0.19 |
| 757.39 | 0.188 |
| 757.626 | 0.188 |
| 757.862 | 0.187 |
| 758.099 | 0.182 |
| 758.335 | 0.184 |
| 758.571 | 0.185 |
| 758.807 | 0.182 |
| 759.044 | 0.176 |
| 759.28 | 0.179 |
| 759.516 | 0.175 |
| 759.752 | 0.181 |
| 759.989 | 0.171 |
| 760.225 | 0.17 |
| 760.461 | 0.169 |
| 760.697 | 0.167 |
| 760.934 | 0.167 |
| 761.17 | 0.171 |
| 761.406 | 0.166 |
| 761.643 | 0.165 |
| 761.879 | 0.162 |
| 762.115 | 0.161 |
| 762.352 | 0.162 |
| 762.588 | 0.158 |
| 762.825 | 0.159 |
| 763.061 | 0.158 |
| 763.297 | 0.153 |
| 763.534 | 0.157 |
| 763.77 | 0.152 |
| 764.007 | 0.152 |
| 764.243 | 0.152 |
| 764.479 | 0.151 |
| 764.716 | 0.148 |
| 764.952 | 0.146 |
| 765.189 | 0.144 |
| 765.425 | 0.145 |
| 765.662 | 0.143 |
| 765.898 | 0.144 |
| 766.135 | 0.141 |
| 766.371 | 0.142 |
| 766.608 | 0.139 |
| 766.844 | 0.139 |
| 767.081 | 0.138 |
| 767.317 | 0.139 |
| 767.554 | 0.136 |
| 767.791 | 0.135 |
| 768.027 | 0.135 |
| 768.264 | 0.133 |
| 768.5 | 0.132 |
| 768.737 | 0.133 |
| 768.973 | 0.13 |
| 769.21 | 0.129 |
| 769.447 | 0.129 |
| 769.683 | 0.127 |
| 769.92 | 0.127 |
| 770.157 | 0.126 |
| 770.393 | 0.123 |
| 770.63 | 0.123 |
| 770.867 | 0.122 |
| 771.103 | 0.122 |
| 771.34 | 0.121 |
| 771.577 | 0.121 |
| 771.813 | 0.122 |
| 772.05 | 0.119 |
| 772.287 | 0.116 |
| 772.524 | 0.114 |
| 772.76 | 0.116 |
| 772.997 | 0.112 |
| 773.234 | 0.114 |
| 773.471 | 0.104 |
| 773.707 | 0.11 |
| 773.944 | 0.11 |
| 774.181 | 0.11 |
| 774.418 | 0.111 |
| 774.654 | 0.114 |
| 774.891 | 0.106 |
| 775.128 | 0.107 |
| 775.365 | 0.106 |
| 775.602 | 0.108 |
| 775.839 | 0.103 |
| 776.075 | 0.105 |
| 776.312 | 0.104 |
| 776.549 | 0.104 |
| 776.786 | 0.101 |
| 777.023 | 0.106 |
| 777.26 | 0.096 |
| 777.497 | 0.098 |
| 777.734 | 0.101 |
| 777.971 | 0.1 |
| 778.208 | 0.095 |
| 778.444 | 0.092 |
| 778.681 | 0.096 |
| 778.918 | 0.101 |
| 779.155 | 0.094 |
| 779.392 | 0.097 |
| 779.629 | 0.092 |
| 779.866 | 0.099 |
| 780.103 | 0.09 |
| 780.34 | 0.094 |
| 780.577 | 0.089 |
| 780.814 | 0.092 |
| 781.051 | 0.09 |
| 781.288 | 0.087 |
| 781.525 | 0.084 |
| 781.763 | 0.09 |
| 782.0 | 0.089 |
| 782.237 | 0.089 |
| 782.474 | 0.086 |
| 782.711 | 0.087 |
| 782.948 | 0.086 |
| 783.185 | 0.089 |
| 783.422 | 0.082 |
| 783.659 | 0.084 |
| 783.896 | 0.082 |
| 784.134 | 0.08 |
| 784.371 | 0.076 |
| 784.608 | 0.083 |
| 784.845 | 0.083 |
| 785.082 | 0.082 |
| 785.319 | 0.076 |
| 785.557 | 0.075 |
| 785.794 | 0.076 |
| 786.031 | 0.076 |
| 786.268 | 0.075 |
| 786.505 | 0.078 |
| 786.743 | 0.074 |
| 786.98 | 0.073 |
| 787.217 | 0.072 |
| 787.454 | 0.071 |
| 787.692 | 0.072 |
| 787.929 | 0.072 |
| 788.166 | 0.069 |
| 788.404 | 0.068 |
| 788.641 | 0.066 |
| 788.878 | 0.07 |
| 789.115 | 0.07 |
| 789.353 | 0.071 |
| 789.59 | 0.071 |
| 789.827 | 0.069 |
| 790.065 | 0.07 |
| 790.302 | 0.071 |
| 790.539 | 0.067 |
| 790.777 | 0.066 |
| 791.014 | 0.064 |
| 791.252 | 0.065 |
| 791.489 | 0.064 |
| 791.726 | 0.063 |
| 791.964 | 0.068 |
| 792.201 | 0.065 |
| 792.439 | 0.061 |
| 792.676 | 0.064 |
| 792.914 | 0.067 |
| 793.151 | 0.061 |
| 793.388 | 0.063 |
| 793.626 | 0.061 |
| 793.863 | 0.067 |
| 794.101 | 0.062 |
| 794.338 | 0.058 |
| 794.576 | 0.054 |
| 794.813 | 0.057 |
| 795.051 | 0.057 |
| 795.288 | 0.061 |
| 795.526 | 0.061 |
| 795.764 | 0.057 |
| 796.001 | 0.055 |
| 796.239 | 0.05 |
| 796.476 | 0.052 |
| 796.714 | 0.053 |
| 796.951 | 0.056 |
| 797.189 | 0.06 |
| 797.427 | 0.054 |
| 797.664 | 0.05 |
| 797.902 | 0.053 |
| 798.139 | 0.058 |
| 798.377 | 0.054 |
| 798.615 | 0.053 |
| 798.852 | 0.049 |
| 799.09 | 0.051 |
| 799.328 | 0.048 |
| 799.565 | 0.054 |
| 799.803 | 0.045 |
| 800.041 | 0.052 |
| 800.278 | 0.051 |
| 800.516 | 0.049 |
| 800.754 | 0.043 |
| 800.991 | 0.05 |
| 801.229 | 0.047 |
| 801.467 | 0.048 |
| 801.705 | 0.039 |
| 801.942 | 0.045 |
| 802.18 | 0.041 |
| 802.418 | 0.049 |
| 802.656 | 0.04 |
| 802.894 | 0.047 |
| 803.131 | 0.044 |
| 803.369 | 0.042 |
| 803.607 | 0.044 |
| 803.845 | 0.041 |
| 804.083 | 0.046 |
| 804.32 | 0.046 |
| 804.558 | 0.042 |
| 804.796 | 0.044 |
| 805.034 | 0.045 |
| 805.272 | 0.048 |
| 805.51 | 0.038 |
| 805.748 | 0.029 |
| 805.985 | 0.042 |
| 806.223 | 0.046 |
| 806.461 | 0.04 |
| 806.699 | 0.039 |
| 806.937 | 0.041 |
| 807.175 | 0.038 |
| 807.413 | 0.039 |
| 807.651 | 0.039 |
| 807.889 | 0.033 |
| 808.127 | 0.041 |
| 808.365 | 0.039 |
| 808.603 | 0.039 |
| 808.841 | 0.038 |
| 809.079 | 0.04 |
| 809.317 | 0.037 |
| 809.555 | 0.035 |
| 809.793 | 0.031 |
| 810.031 | 0.033 |
| 810.269 | 0.03 |
| 810.507 | 0.033 |
| 810.745 | 0.037 |
| 810.983 | 0.036 |
| 811.221 | 0.031 |
| 811.459 | 0.031 |
| 811.697 | 0.033 |
| 811.935 | 0.03 |
| 812.173 | 0.031 |
| 812.411 | 0.033 |
| 812.649 | 0.032 |
| 812.888 | 0.033 |
| 813.126 | 0.033 |
| 813.364 | 0.03 |
| 813.602 | 0.032 |
| 813.84 | 0.036 |
| 814.078 | 0.033 |
| 814.316 | 0.03 |
| 814.555 | 0.032 |
| 814.793 | 0.033 |
| 815.031 | 0.028 |
| 815.269 | 0.027 |
| 815.507 | 0.028 |
| 815.745 | 0.03 |
| 815.984 | 0.03 |
| 816.222 | 0.035 |
| 816.46 | 0.029 |
| 816.698 | 0.031 |
| 816.937 | 0.03 |
| 817.175 | 0.029 |
| 817.413 | 0.027 |
| 817.651 | 0.026 |
| 817.89 | 0.026 |
| 818.128 | 0.028 |
| 818.366 | 0.028 |
| 818.605 | 0.03 |
| 818.843 | 0.033 |
| 819.081 | 0.035 |
| 819.319 | 0.028 |
| 819.558 | 0.032 |
| 819.796 | 0.026 |
| 820.035 | 0.032 |
| 820.273 | 0.027 |
| 820.511 | 0.03 |
| 820.75 | 0.024 |
| 820.988 | 0.029 |
| 821.226 | 0.024 |
| 821.465 | 0.021 |
| 821.703 | 0.024 |
| 821.942 | 0.027 |
| 822.18 | 0.022 |
| 822.418 | 0.029 |
| 822.657 | 0.024 |
| 822.895 | 0.025 |
| 823.134 | 0.025 |
| 823.372 | 0.023 |
| 823.611 | 0.026 |
| 823.849 | 0.025 |
| 824.088 | 0.018 |
| 824.326 | 0.027 |
| 824.565 | 0.022 |
| 824.803 | 0.025 |
| 825.042 | 0.022 |
| 825.28 | 0.025 |
| 825.519 | 0.025 |
| 825.757 | 0.022 |
| 825.996 | 0.019 |
| 826.234 | 0.021 |
| 826.473 | 0.024 |
| 826.711 | 0.02 |
| 826.95 | 0.021 |
| 827.188 | 0.023 |
| 827.427 | 0.02 |
| 827.666 | 0.024 |
| 827.904 | 0.018 |
| 828.143 | 0.025 |
| 828.381 | 0.025 |
| 828.62 | 0.023 |
| 828.859 | 0.016 |
| 829.097 | 0.02 |
| 829.336 | 0.018 |
| 829.575 | 0.022 |
| 829.813 | 0.02 |
| 830.052 | 0.02 |
| 830.291 | 0.017 |
| 830.529 | 0.02 |
| 830.768 | 0.017 |
| 831.007 | 0.022 |
| 831.245 | 0.021 |
| 831.484 | 0.021 |
| 831.723 | 0.022 |
| 831.961 | 0.021 |
| 832.2 | 0.019 |
| 832.439 | 0.021 |
| 832.678 | 0.019 |
| 832.916 | 0.021 |
| 833.155 | 0.023 |
| 833.394 | 0.02 |
| 833.633 | 0.016 |
| 833.872 | 0.018 |
| 834.11 | 0.021 |
| 834.349 | 0.02 |
| 834.588 | 0.019 |
| 834.827 | 0.02 |
| 835.066 | 0.016 |
| 835.304 | 0.016 |
| 835.543 | 0.017 |
| 835.782 | 0.015 |
| 836.021 | 0.016 |
| 836.26 | 0.018 |
| 836.499 | 0.017 |
| 836.738 | 0.02 |
| 836.976 | 0.02 |
| 837.215 | 0.017 |
| 837.454 | 0.017 |
| 837.693 | 0.017 |
| 837.932 | 0.018 |
| 838.171 | 0.016 |
| 838.41 | 0.017 |
| 838.649 | 0.018 |
| 838.888 | 0.018 |
| 839.127 | 0.016 |
| 839.366 | 0.015 |
| 839.605 | 0.015 |
| 839.844 | 0.017 |
| 840.083 | 0.015 |
| 840.322 | 0.018 |
| 840.561 | 0.015 |
| 840.8 | 0.013 |
| 841.039 | 0.015 |
| 841.278 | 0.02 |
| 841.517 | 0.017 |
| 841.756 | 0.022 |
| 841.995 | 0.016 |
| 842.234 | 0.019 |
| 842.473 | 0.014 |
| 842.712 | 0.016 |
| 842.951 | 0.014 |
| 843.19 | 0.017 |
| 843.429 | 0.015 |
| 843.668 | 0.014 |
| 843.907 | 0.015 |
| 844.146 | 0.018 |
| 844.385 | 0.011 |
| 844.624 | 0.014 |
| 844.864 | 0.014 |
| 845.103 | 0.011 |
| 845.342 | 0.015 |
| 845.581 | 0.016 |
| 845.82 | 0.012 |
| 846.059 | 0.013 |
| 846.298 | 0.011 |
| 846.538 | 0.015 |
| 846.777 | 0.011 |
| 847.016 | 0.01 |
| 847.255 | 0.012 |
| 847.494 | 0.013 |
| 847.734 | 0.008 |
| 847.973 | 0.016 |
| 848.212 | 0.01 |
| 848.451 | 0.01 |
| 848.691 | 0.014 |
| 848.93 | 0.013 |
| 849.169 | 0.011 |
| 849.408 | 0.018 |
| 849.648 | 0.013 |
| 849.887 | 0.014 |
| 850.126 | 0.009 |
| 850.365 | 0.015 |
| 850.605 | 0.008 |
| 850.844 | 0.013 |
| 851.083 | 0.013 |
| 851.323 | 0.013 |
| 851.562 | 0.012 |
| 851.801 | 0.01 |
| 852.041 | 0.013 |
| 852.28 | 0.008 |
| 852.519 | 0.006 |
| 852.759 | 0.011 |
| 852.998 | 0.011 |
| 853.237 | 0.011 |
| 853.477 | 0.015 |
| 853.716 | 0.009 |
| 853.956 | 0.008 |
| 854.195 | 0.012 |
| 854.434 | 0.006 |
| 854.674 | 0.012 |
| 854.913 | 0.014 |
| 855.153 | 0.012 |
| 855.392 | 0.009 |
| 855.632 | 0.011 |
| 855.871 | 0.014 |
| 856.11 | 0.013 |
| 856.35 | 0.01 |
| 856.589 | 0.008 |
| 856.829 | 0.007 |
| 857.068 | 0.008 |
| 857.308 | 0.006 |
| 857.547 | 0.011 |
| 857.787 | 0.011 |
| 858.026 | 0.011 |
| 858.266 | 0.011 |
| 858.505 | 0.007 |
| 858.745 | 0.008 |
| 858.985 | 0.008 |
| 859.224 | 0.006 |
| 859.464 | 0.008 |
| 859.703 | 0.008 |
| 859.943 | 0.007 |
| 860.182 | 0.006 |
| 860.422 | 0.008 |
| 860.662 | 0.01 |
| 860.901 | 0.008 |
| 861.141 | 0.007 |
| 861.38 | 0.012 |
| 861.62 | 0.013 |
| 861.86 | 0.012 |
| 862.099 | 0.01 |
| 862.339 | 0.01 |
| 862.579 | 0.015 |
| 862.818 | 0.012 |
| 863.058 | 0.01 |
| 863.298 | 0.008 |
| 863.537 | 0.004 |
| 863.777 | 0.007 |
| 864.017 | 0.012 |
| 864.256 | 0.01 |
| 864.496 | 0.008 |
| 864.736 | 0.006 |
| 864.975 | 0.009 |
| 865.215 | 0.007 |
| 865.455 | 0.01 |
| 865.695 | 0.012 |
| 865.934 | 0.008 |
| 866.174 | 0.006 |
| 866.414 | 0.015 |
| 866.654 | 0.01 |
| 866.893 | 0.013 |
| 867.133 | 0.007 |
| 867.373 | 0.009 |
| 867.613 | 0.011 |
| 867.853 | 0.01 |
| 868.092 | 0.01 |
| 868.332 | 0.009 |
| 868.572 | 0.007 |
| 868.812 | 0.01 |
| 869.052 | 0.01 |
| 869.292 | 0.014 |
| 869.531 | 0.012 |
| 869.771 | 0.014 |
| 870.011 | 0.008 |
| 870.251 | 0.011 |
| 870.491 | 0.007 |
| 870.731 | 0.008 |
| 870.971 | 0.011 |
| 871.211 | 0.009 |
| 871.45 | 0.003 |
| 871.69 | 0.011 |
| 871.93 | 0.007 |
| 872.17 | 0.005 |
| 872.41 | 0.005 |
| 872.65 | 0.009 |
| 872.89 | 0.011 |
| 873.13 | 0.015 |
| 873.37 | 0.009 |
| 873.61 | 0.014 |
| 873.85 | 0.013 |
| 874.09 | 0.018 |
| 874.33 | 0.005 |
| 874.57 | 0.01 |
| 874.81 | 0.004 |
| 875.05 | 0.013 |
| 875.29 | 0.006 |
| 875.53 | 0.004 |
| 875.77 | 0.013 |
| 876.01 | 0.004 |
| 876.25 | 0.013 |
| 876.49 | 0.012 |
| 876.73 | 0.005 |
| 876.97 | 0.003 |
| 877.21 | 0.011 |
| 877.45 | 0.007 |
| 877.69 | 0.014 |
| 877.93 | 0.013 |
| 878.171 | 0.006 |
| 878.411 | 0.01 |
| 878.651 | 0.012 |
| 878.891 | 0.006 |
| 879.131 | 0.007 |
| 879.371 | 0.002 |
| 879.611 | 0.006 |
| 879.851 | 0.005 |
| 880.091 | 0.007 |
| 880.332 | 0.005 |
| 880.572 | 0.007 |
| 880.812 | 0.003 |
| 881.052 | 0.005 |
| 881.292 | 0.011 |
| 881.533 | 0.008 |
| 881.773 | 0.001 |
| 882.013 | 0.012 |
| 882.253 | 0.01 |
| 882.493 | 0.01 |
| 882.734 | 0.006 |
| 882.974 | 0.007 |
| 883.214 | 0.003 |
| 883.454 | 0.007 |
| 883.695 | 0.005 |
| 883.935 | 0.007 |
| 884.175 | 0.009 |
| 884.415 | 0.013 |
| 884.656 | 0.007 |
| 884.896 | 0.006 |
| 885.136 | 0.003 |
| 885.376 | 0.006 |
| 885.617 | 0.005 |
| 885.857 | 0.007 |
| 886.097 | 0.009 |
| 886.338 | 0.016 |
| 886.578 | 0.015 |
| 886.818 | 0.008 |
| 887.059 | 0.005 |
| 887.299 | 0.011 |
| 887.539 | 0.011 |
| 887.78 | 0.008 |
| 888.02 | 0.008 |
| 888.26 | 0.006 |
| 888.501 | 0.004 |
| 888.741 | 0.009 |
| 888.982 | 0.009 |
| 889.222 | 0.002 |
| 889.462 | 0.001 |
| 889.703 | 0.008 |
| 889.943 | 0.008 |
| 890.184 | 0.004 |
| 890.424 | 0.007 |
| 890.665 | 0.007 |
| 890.905 | 0.011 |
| 891.145 | 0.013 |
| 891.386 | 0.01 |
| 891.626 | 0.003 |
| 891.867 | 0.004 |
| 892.107 | 0.005 |
| 892.348 | 0.002 |
| 892.588 | 0.002 |
| 892.829 | 0.004 |
| 893.069 | 0.003 |
| 893.31 | 0.011 |
| 893.55 | 0.013 |
| 893.791 | 0.008 |
| 894.031 | 0.005 |
| 894.272 | 0.007 |
| 894.512 | 0.005 |
| 894.753 | 0.009 |
| 894.994 | 0.008 |
| 895.234 | 0.007 |
| 895.475 | 0.01 |
| 895.715 | 0.012 |
| 895.956 | 0.004 |
| 896.196 | 0.001 |
| 896.437 | 0.008 |
| 896.678 | 0.009 |
| 896.918 | 0.007 |
| 897.159 | 0.009 |
| 897.399 | 0.003 |
| 897.64 | 0.007 |
| 897.881 | 0.005 |
| 898.121 | 0.008 |
| 898.362 | 0.008 |
| 898.603 | 0.013 |
| 898.843 | 0.014 |
| 899.084 | 0.016 |
| 899.325 | 0.005 |
| 899.565 | 0.015 |
| 899.806 | 0.01 |
| 900.047 | 0.011 |
| 900.287 | 0.007 |
| 900.528 | 0.012 |
| 900.769 | 0.016 |
| 901.009 | 0.015 |
| 901.25 | 0.009 |
| 901.491 | 0.016 |
| 901.732 | 0.011 |
| 901.972 | 0.011 |
| 902.213 | 0.008 |
| 902.454 | 0.023 |
| 902.695 | 0.012 |
| 902.935 | 0.007 |
| 903.176 | 0.012 |
| 903.417 | 0.008 |
| 903.658 | 0.005 |
| 903.898 | 0.017 |
| 904.139 | 0.007 |
| 904.38 | 0.006 |
| 904.621 | -0.003 |
| 904.862 | 0.013 |
| 905.103 | 0.006 |
| 905.343 | 0.011 |
| 905.584 | 0.004 |
| 905.825 | 0.002 |
| 906.066 | 0.002 |
| 906.307 | 0.007 |
| 906.548 | 0.016 |
| 906.788 | 0.018 |
| 907.029 | 0.017 |
| 907.27 | 0.012 |
| 907.511 | 0.001 |
| 907.752 | 0.008 |
| 907.993 | 0.002 |
| 908.234 | 0.009 |
| 908.475 | 0.014 |
| 908.716 | 0.007 |
| 908.956 | 0.009 |
| 909.197 | 0.014 |
| 909.438 | 0.018 |
| 909.679 | 0.014 |
| 909.92 | 0.009 |
| 910.161 | 0.01 |
| 910.402 | 0.002 |
| 910.643 | 0.012 |
| 910.884 | 0.015 |
| 911.125 | 0.011 |
| 911.366 | 0.011 |
| 911.607 | 0.021 |
| 911.848 | 0.002 |
| 912.089 | 0.005 |
| 912.33 | 0.004 |
| 912.571 | 0.007 |
| 912.812 | 0.012 |
| 913.053 | 0.005 |
| 913.294 | 0.011 |
| 913.535 | 0.015 |
| 913.776 | 0.008 |
| 914.017 | 0.006 |
| 914.258 | 0.003 |
| 914.499 | 0.016 |
| 914.74 | 0.016 |
| 914.981 | 0.01 |
| 915.223 | 0.011 |
| 915.464 | 0.007 |
| 915.705 | 0.003 |
| 915.946 | -0.003 |
| 916.187 | 0.009 |
| 916.428 | 0.01 |
| 916.669 | 0.005 |
| 916.91 | 0.007 |
| 917.151 | 0.012 |
| 917.393 | 0.018 |
| 917.634 | 0.007 |
| 917.875 | 0.006 |
| 918.116 | 0.002 |
| 918.357 | 0.008 |
| 918.598 | 0.011 |
| 918.839 | 0.017 |
| 919.081 | 0.017 |
| 919.322 | 0.013 |
| 919.563 | 0.009 |
| 919.804 | 0.009 |
| 920.045 | 0.011 |
| 920.287 | 0.019 |
| 920.528 | 0.015 |
| 920.769 | 0.01 |
| 921.01 | 0.005 |
| 921.251 | 0.003 |
| 921.493 | 0.006 |
| 921.734 | 0.012 |
| 921.975 | 0.009 |
| 922.216 | 0.009 |
| 922.458 | 0.012 |
| 922.699 | 0.012 |
| 922.94 | 0.016 |
| 923.182 | 0.011 |
| 923.423 | 0.006 |
| 923.664 | 0.003 |
| 923.905 | 0 |
| 924.147 | 0.006 |
| 924.388 | 0.011 |
| 924.629 | 0.016 |
| 924.871 | 0.017 |
| 925.112 | 0.017 |
| 925.353 | 0.009 |
| 925.595 | -0.002 |
| 925.836 | 0.005 |
| 926.077 | 0.003 |
| 926.319 | 0.009 |
| 926.56 | 0.02 |
| 926.801 | 0.015 |
| 927.043 | 0.006 |
| 927.284 | 0.007 |
| 927.526 | 0.001 |
| 927.767 | 0.006 |
| 928.008 | 0.007 |
| 928.25 | 0.012 |
| 928.491 | 0.003 |
| 928.733 | 0.01 |
| 928.974 | 0.019 |
| 929.215 | 0.012 |
| 929.457 | 0.002 |
| 929.698 | -0.003 |
| 929.94 | 0 |
| 930.181 | 0.009 |
| 930.423 | 0.005 |
| 930.664 | 0.008 |
| 930.906 | 0.017 |
| 931.147 | 0.006 |
| 931.389 | 0 |
| 931.63 | 0.003 |
| 931.872 | 0.009 |
| 932.113 | 0.009 |
| 932.355 | 0.002 |
| 932.596 | 0.013 |
| 932.838 | 0.01 |
| 933.079 | 0.006 |
| 933.321 | 0.001 |
| 933.562 | 0.008 |
| 933.804 | 0.018 |
| 934.045 | 0.009 |
| 934.287 | 0.013 |
| 934.528 | 0.006 |
| 934.77 | 0.007 |
| 935.011 | 0.008 |
| 935.253 | 0.008 |
| 935.495 | 0.012 |
| 935.736 | 0.006 |
| 935.978 | 0.028 |
| 936.219 | 0.023 |
| 936.461 | 0.02 |
| 936.703 | 0.009 |
| 936.944 | 0.012 |
| 937.186 | 0.01 |
| 937.427 | 0.014 |
| 937.669 | 0.011 |
| 937.911 | -0.003 |
| 938.152 | 0.01 |
| 938.394 | -0.003 |
| 938.636 | 0.006 |
| 938.877 | 0.021 |
| 939.119 | 0.014 |
| 939.361 | 0.006 |
| 939.602 | 0.012 |
| 939.844 | -0.002 |
| 940.086 | 0.005 |
| 940.327 | 0.003 |
| 940.569 | 0.012 |
| 940.811 | 0.017 |
| 941.052 | 0.011 |
| 941.294 | 0.023 |
| 941.536 | 0.015 |
| 941.778 | 0.014 |
| 942.019 | 0.012 |
| 942.261 | -0.003 |
| 942.503 | 0.021 |
| 942.745 | 0.012 |
| 942.986 | 0.005 |
| 943.228 | 0.013 |
| 943.47 | 0.023 |
| 943.712 | 0.019 |
| 943.953 | 0.007 |
| 944.195 | 0.001 |
| 944.437 | 0.011 |
| 944.679 | -0.005 |
| 944.921 | 0.017 |
| 945.162 | 0.009 |
| 945.404 | 0.013 |
| 945.646 | 0.014 |
| 945.888 | 0.023 |
| 946.13 | 0.02 |
| 946.371 | 0.009 |
| 946.613 | 0.004 |
| 946.855 | 0.006 |
| 947.097 | 0.011 |
| 947.339 | 0.037 |
| 947.581 | 0.029 |
| 947.823 | 0.029 |
| 948.064 | 0.012 |
| 948.306 | 0.038 |
| 948.548 | -0.011 |
| 948.79 | 0.008 |
| 949.032 | 0.004 |
| 949.274 | 0.023 |
| 949.516 | 0.004 |
| 949.758 | 0.027 |
| 950.0 | 0.013 |
| 950.242 | 0.015 |
| 950.483 | 0.027 |
| 950.725 | 0.031 |
| 950.967 | 0.007 |
| 951.209 | 0.008 |
| 951.451 | 0.001 |
| 951.693 | 0.009 |
| 951.935 | 0.014 |
| 952.177 | 0.019 |
| 952.419 | 0.007 |
| 952.661 | 0.01 |
| 952.903 | 0.001 |
| 953.145 | 0.016 |
| 953.387 | -0.004 |
| 953.629 | 0.004 |
| 953.871 | -0.001 |
| 954.113 | 0 |
| 954.355 | 0.012 |
| 954.597 | 0.016 |
| 954.839 | 0.003 |
| 955.081 | 0.007 |
| 955.323 | 0.012 |
| 955.565 | 0.015 |
| 955.807 | 0.008 |
| 956.049 | 0.012 |
| 956.291 | 0.002 |
| 956.533 | 0.017 |
| 956.775 | 0.013 |
| 957.018 | 0.021 |
| 957.26 | 0.007 |
| 957.502 | 0.008 |
| 957.744 | 0 |
| 957.986 | 0.012 |
| 958.228 | 0.012 |
| 958.47 | 0.006 |
| 958.712 | 0.005 |
| 958.954 | 0.009 |
| 959.196 | 0.011 |
| 959.439 | 0.022 |
| 959.681 | 0.018 |
| 959.923 | 0.012 |
| 960.165 | 0.023 |
| 960.407 | 0.014 |
| 960.649 | 0.015 |
| 960.891 | 0.017 |
| 961.134 | 0.018 |
| 961.376 | 0.023 |
| 961.618 | 0.007 |
| 961.86 | 0.002 |
| 962.102 | 0.006 |
| 962.345 | 0.012 |
| 962.587 | 0.012 |
| 962.829 | 0.018 |
| 963.071 | 0.007 |
| 963.313 | 0.009 |
| 963.556 | 0.005 |
| 963.798 | 0.006 |
| 964.04 | 0.016 |
| 964.282 | 0.018 |
| 964.524 | 0.011 |
| 964.767 | 0.024 |
| 965.009 | 0.024 |
| 965.251 | 0.013 |
| 965.493 | 0.012 |
| 965.736 | 0.016 |
| 965.978 | 0.021 |
| 966.22 | 0.023 |
| 966.463 | 0.011 |
| 966.705 | 0.008 |
| 966.947 | 0.008 |
| 967.189 | 0.019 |
| 967.432 | 0.025 |
| 967.674 | 0.014 |
| 967.916 | 0.014 |
| 968.159 | 0.02 |
| 968.401 | 0.02 |
| 968.643 | 0.012 |
| 968.886 | 0.002 |
| 969.128 | 0.005 |
| 969.37 | 0.015 |
| 969.613 | 0.018 |
| 969.855 | 0.012 |
| 970.097 | 0.007 |
| 970.34 | 0.014 |
| 970.582 | 0.02 |
| 970.825 | 0.018 |
| 971.067 | 0 |
| 971.309 | 0.011 |
| 971.552 | 0.024 |
| 971.794 | 0.019 |
| 972.037 | 0.015 |
| 972.279 | 0.012 |
| 972.521 | 0.006 |
| 972.764 | 0.022 |
| 973.006 | 0.014 |
| 973.249 | 0.006 |
| 973.491 | 0.012 |
| 973.733 | 0.004 |
| 973.976 | 0 |
| 974.218 | 0.003 |
| 974.461 | 0.011 |
| 974.703 | 0.015 |
| 974.946 | 0.006 |
| 975.188 | 0.014 |
| 975.431 | 0.025 |
| 975.673 | 0.02 |
| 975.916 | 0.005 |
| 976.158 | 0.02 |
| 976.401 | 0.02 |
| 976.643 | 0.01 |
| 976.886 | 0.009 |
| 977.128 | 0.029 |
| 977.371 | 0.034 |
| 977.613 | 0.032 |
| 977.856 | -0.004 |
| 978.098 | 0.002 |
| 978.341 | 0.01 |
| 978.583 | 0.006 |
| 978.826 | 0.015 |
| 979.068 | 0.019 |
| 979.311 | 0.01 |
| 979.553 | 0.036 |
| 979.796 | 0.014 |
| 980.039 | 0.004 |
| 980.281 | 0.002 |
| 980.524 | 0.004 |
| 980.766 | 0.005 |
| 981.009 | 0.01 |
| 981.252 | 0.015 |
| 981.494 | 0.01 |
| 981.737 | -0.001 |
| 981.979 | 0.016 |
| 982.222 | 0.025 |
| 982.465 | 0.022 |
| 982.707 | 0.007 |
| 982.95 | 0.036 |
| 983.192 | 0.011 |
| 983.435 | 0.004 |
| 983.678 | 0.017 |
| 983.92 | 0.024 |
| 984.163 | 0.004 |
| 984.406 | 0.004 |
| 984.648 | 0.011 |
| 984.891 | 0.025 |
| 985.134 | 0.011 |
| 985.376 | 0.007 |
| 985.619 | 0.019 |
| 985.862 | 0.028 |
| 986.104 | 0.01 |
| 986.347 | 0.011 |
| 986.59 | 0.017 |
| 986.833 | 0.024 |
| 987.075 | 0.031 |
| 987.318 | 0.029 |
| 987.561 | 0.031 |
| 987.803 | 0.03 |
| 988.046 | 0.011 |
| 988.289 | 0.012 |
| 988.532 | 0.01 |
| 988.774 | 0.009 |
| 989.017 | 0.011 |
| 989.26 | 0.035 |
| 989.503 | 0.009 |
| 989.745 | 0.016 |
| 989.988 | 0.01 |
| 990.231 | 0.013 |
| 990.474 | 0.009 |
| 990.717 | 0.017 |
| 990.959 | 0.011 |
| 991.202 | 0.011 |
| 991.445 | -0.003 |
| 991.688 | 0.014 |
| 991.931 | 0.032 |
| 992.173 | 0.028 |
| 992.416 | 0.003 |
| 992.659 | 0.033 |
| 992.902 | 0.007 |
| 993.145 | 0.019 |
| 993.388 | 0.013 |
| 993.63 | 0.017 |
| 993.873 | 0 |
| 994.116 | 0.032 |
| 994.359 | 0.006 |
| 994.602 | 0.015 |
| 994.845 | 0.017 |
| 995.088 | 0.015 |
| 995.33 | 0.021 |
| 995.573 | 0.017 |
| 995.816 | 0.008 |
| 996.059 | 0.029 |
| 996.302 | 0 |
| 996.545 | 0.024 |
| 996.788 | 0.024 |
| 997.031 | 0.019 |
| 997.274 | 0.033 |
| 997.517 | 0.015 |
| 997.759 | -0.001 |
| 998.002 | 0.023 |
| 998.245 | 0.048 |
| 998.488 | 0.019 |
| 998.731 | 0.037 |
| 998.974 | 0.029 |
| 999.217 | 0.021 |
| 999.46 | 0.034 |
| 999.703 | 0.015 |
| 999.946 | 0.011 |
| 1000.189 | 0.018 |
| 1000.432 | 0.004 |
| 1000.675 | 0.044 |
| 1000.918 | -0.002 |
| 1001.161 | 0.038 |
| 1001.404 | 0.02 |
| 1001.647 | 0.065 |
| 1001.89 | 0.022 |
| 1002.133 | 0.028 |
| 1002.376 | 0.023 |
| 1002.619 | 0.021 |
| 1002.862 | -0.004 |
| 1003.105 | 0.022 |
| 1003.348 | 0.035 |
| 1003.591 | 0.008 |
| 1003.834 | 0 |
| 1004.077 | 0 |
| 1004.32 | 0 |
| 1004.563 | 0 |
| 1004.806 | 0 |
| 1005.049 | 0 |
| 1005.292 | 0 |
| 1005.536 | 0 |
| 1005.779 | 0 |
| 1006.022 | 0 |
| 1006.265 | 0 |
| 1006.508 | 0 |
| 1006.751 | 0 |
| 1006.994 | 0 |
| 1007.237 | 0 |
| 1007.48 | 0 |
| 1007.723 | 0 |
| 1007.967 | 0 |
| 1008.21 | 0 |
| 1008.453 | 0 |
| 1008.696 | 0 |
| 1008.939 | 0 |
| 1009.182 | 0 |
| 1009.425 | 0 |
| 1009.669 | 0 |
| 1009.912 | 0 |
| 1010.155 | 0 |
| 1010.398 | 0 |
| 1010.641 | 0 |
| 1010.884 | 0 |
| 1011.128 | 0 |
| 1011.371 | 0 |
| 1011.614 | 0 |
| 1011.857 | 0 |
| 1012.1 | 0 |
| 1012.343 | 0 |
| 1012.587 | 0 |
| 1012.83 | 0 |
| 1013.073 | 0 |
| 1013.316 | 0 |
| 1013.56 | 0 |
| 1013.803 | 0 |
| 1014.046 | 0 |
| 1014.289 | 0 |
| 1014.533 | 0 |
| 1014.776 | 0 |
| 1015.019 | 0 |
| 1015.262 | 0 |
| 1015.506 | 0 |
| 1015.749 | 0 |
| 1015.992 | 0 |
| 1016.235 | 0 |
| 1016.479 | 0 |
| 1016.722 | 0 |
| 1016.965 | 0 |
| 1017.208 | 0 |
| 1017.452 | 0 |
| 1017.695 | 0 |
| 1017.938 | 0 |
| 1018.182 | 0 |
| 1018.425 | 0 |
| 1018.668 | 0 |
| 1018.912 | 0 |
| 1019.155 | 0 |
| 1019.398 | 0 |
| 1019.642 | 0 |
| 1019.885 | 0 |
| 1020.128 | 0 |
| 1020.372 | 0 |
| 1020.615 | 0 |
| 1020.858 | 0 |
| 1021.102 | 0 |
| 1021.345 | 0 |
| 1021.588 | 0 |
| 1021.832 | 0 |
| 1022.075 | 0 |
| 1022.319 | 0 |
| 1022.562 | 0 |
| 1022.805 | 0 |
| 1023.049 | 0 |
| 1023.292 | 0 |
| 1023.536 | 0 |
| 1023.779 | 0 |
| 1024.022 | 0 |
| 1024.266 | 0 |
| 1024.509 | 0 |
| 1024.753 | 0 |
| 1024.996 | 0 |
| 1025.24 | 0 |
| 1025.483 | 0 |
| 1025.726 | 0 |
| 1025.97 | 0 |
| 1026.213 | 0 |
| 1026.457 | 0 |
| 1026.7 | 0 |
| 1026.944 | 0 |
| 1027.187 | 0 |
| 1027.431 | 0 |